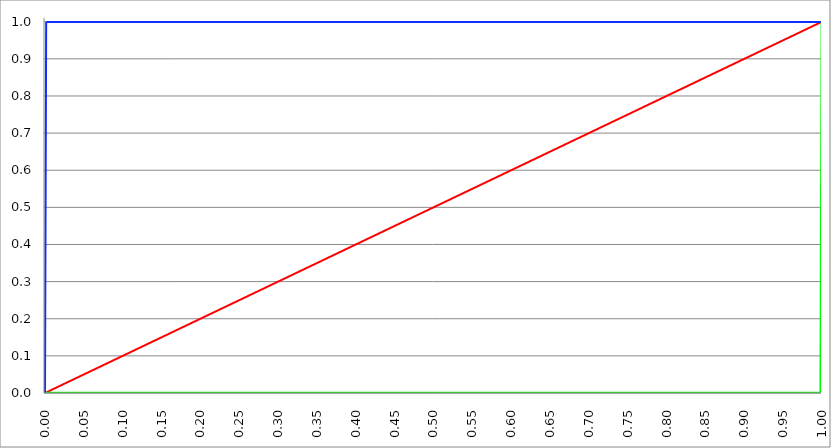
| Category | Series 1 | Series 0 | Series 2 |
|---|---|---|---|
| 0.0 | 0 | 0.001 | 0.001 |
| 0.0005 | 0 | 0.001 | 0.333 |
| 0.001 | 0.001 | 0.001 | 0.666 |
| 0.0015 | 0.002 | 0.001 | 0.999 |
| 0.002 | 0.002 | 0.001 | 0.999 |
| 0.0025 | 0.002 | 0.001 | 0.999 |
| 0.003 | 0.003 | 0.001 | 0.999 |
| 0.0035 | 0.004 | 0.001 | 0.999 |
| 0.004 | 0.004 | 0.001 | 0.999 |
| 0.0045 | 0.004 | 0.001 | 0.999 |
| 0.005 | 0.005 | 0.001 | 0.999 |
| 0.0055 | 0.006 | 0.001 | 0.999 |
| 0.006 | 0.006 | 0.001 | 0.999 |
| 0.0065 | 0.006 | 0.001 | 0.999 |
| 0.007 | 0.007 | 0.001 | 0.999 |
| 0.0075 | 0.008 | 0.001 | 0.999 |
| 0.008 | 0.008 | 0.001 | 0.999 |
| 0.0085 | 0.008 | 0.001 | 0.999 |
| 0.009 | 0.009 | 0.001 | 0.999 |
| 0.0095 | 0.01 | 0.001 | 0.999 |
| 0.01 | 0.01 | 0.001 | 0.999 |
| 0.0105 | 0.01 | 0.001 | 0.999 |
| 0.011 | 0.011 | 0.001 | 0.999 |
| 0.0115 | 0.012 | 0.001 | 0.999 |
| 0.012 | 0.012 | 0.001 | 0.999 |
| 0.0125 | 0.012 | 0.001 | 0.999 |
| 0.013 | 0.013 | 0.001 | 0.999 |
| 0.0135 | 0.014 | 0.001 | 0.999 |
| 0.014 | 0.014 | 0.001 | 0.999 |
| 0.0145 | 0.014 | 0.001 | 0.999 |
| 0.015 | 0.015 | 0.001 | 0.999 |
| 0.0155 | 0.016 | 0.001 | 0.999 |
| 0.016 | 0.016 | 0.001 | 0.999 |
| 0.0165 | 0.016 | 0.001 | 0.999 |
| 0.017 | 0.017 | 0.001 | 0.999 |
| 0.0175 | 0.018 | 0.001 | 0.999 |
| 0.018 | 0.018 | 0.001 | 0.999 |
| 0.0185 | 0.018 | 0.001 | 0.999 |
| 0.019 | 0.019 | 0.001 | 0.999 |
| 0.0195 | 0.02 | 0.001 | 0.999 |
| 0.02 | 0.02 | 0.001 | 0.999 |
| 0.0205 | 0.02 | 0.001 | 0.999 |
| 0.021 | 0.021 | 0.001 | 0.999 |
| 0.0215 | 0.022 | 0.001 | 0.999 |
| 0.022 | 0.022 | 0.001 | 0.999 |
| 0.0225 | 0.022 | 0.001 | 0.999 |
| 0.023 | 0.023 | 0.001 | 0.999 |
| 0.0235 | 0.024 | 0.001 | 0.999 |
| 0.024 | 0.024 | 0.001 | 0.999 |
| 0.0245 | 0.024 | 0.001 | 0.999 |
| 0.025 | 0.025 | 0.001 | 0.999 |
| 0.0255 | 0.026 | 0.001 | 0.999 |
| 0.026 | 0.026 | 0.001 | 0.999 |
| 0.0265 | 0.026 | 0.001 | 0.999 |
| 0.027 | 0.027 | 0.001 | 0.999 |
| 0.0275 | 0.028 | 0.001 | 0.999 |
| 0.028 | 0.028 | 0.001 | 0.999 |
| 0.0285 | 0.028 | 0.001 | 0.999 |
| 0.029 | 0.029 | 0.001 | 0.999 |
| 0.0295 | 0.03 | 0.001 | 0.999 |
| 0.03 | 0.03 | 0.001 | 0.999 |
| 0.0305 | 0.03 | 0.001 | 0.999 |
| 0.031 | 0.031 | 0.001 | 0.999 |
| 0.0315 | 0.032 | 0.001 | 0.999 |
| 0.032 | 0.032 | 0.001 | 0.999 |
| 0.0325 | 0.032 | 0.001 | 0.999 |
| 0.033 | 0.033 | 0.001 | 0.999 |
| 0.0335 | 0.034 | 0.001 | 0.999 |
| 0.034 | 0.034 | 0.001 | 0.999 |
| 0.0345 | 0.034 | 0.001 | 0.999 |
| 0.035 | 0.035 | 0.001 | 0.999 |
| 0.0355 | 0.036 | 0.001 | 0.999 |
| 0.036 | 0.036 | 0.001 | 0.999 |
| 0.0365 | 0.036 | 0.001 | 0.999 |
| 0.037 | 0.037 | 0.001 | 0.999 |
| 0.0375 | 0.038 | 0.001 | 0.999 |
| 0.038 | 0.038 | 0.001 | 0.999 |
| 0.0385 | 0.038 | 0.001 | 0.999 |
| 0.039 | 0.039 | 0.001 | 0.999 |
| 0.0395 | 0.04 | 0.001 | 0.999 |
| 0.04 | 0.04 | 0.001 | 0.999 |
| 0.0405 | 0.04 | 0.001 | 0.999 |
| 0.041 | 0.041 | 0.001 | 0.999 |
| 0.0415 | 0.042 | 0.001 | 0.999 |
| 0.042 | 0.042 | 0.001 | 0.999 |
| 0.0425 | 0.042 | 0.001 | 0.999 |
| 0.043 | 0.043 | 0.001 | 0.999 |
| 0.0435 | 0.044 | 0.001 | 0.999 |
| 0.044 | 0.044 | 0.001 | 0.999 |
| 0.0445 | 0.044 | 0.001 | 0.999 |
| 0.045 | 0.045 | 0.001 | 0.999 |
| 0.0455 | 0.046 | 0.001 | 0.999 |
| 0.046 | 0.046 | 0.001 | 0.999 |
| 0.0465 | 0.046 | 0.001 | 0.999 |
| 0.047 | 0.047 | 0.001 | 0.999 |
| 0.0475 | 0.048 | 0.001 | 0.999 |
| 0.048 | 0.048 | 0.001 | 0.999 |
| 0.0485 | 0.048 | 0.001 | 0.999 |
| 0.049 | 0.049 | 0.001 | 0.999 |
| 0.0495 | 0.05 | 0.001 | 0.999 |
| 0.05 | 0.05 | 0.001 | 0.999 |
| 0.0505 | 0.05 | 0.001 | 0.999 |
| 0.051 | 0.051 | 0.001 | 0.999 |
| 0.0515 | 0.052 | 0.001 | 0.999 |
| 0.052 | 0.052 | 0.001 | 0.999 |
| 0.0525 | 0.052 | 0.001 | 0.999 |
| 0.053 | 0.053 | 0.001 | 0.999 |
| 0.0535 | 0.054 | 0.001 | 0.999 |
| 0.054 | 0.054 | 0.001 | 0.999 |
| 0.0545 | 0.054 | 0.001 | 0.999 |
| 0.055 | 0.055 | 0.001 | 0.999 |
| 0.0555 | 0.056 | 0.001 | 0.999 |
| 0.056 | 0.056 | 0.001 | 0.999 |
| 0.0565 | 0.056 | 0.001 | 0.999 |
| 0.057 | 0.057 | 0.001 | 0.999 |
| 0.0575 | 0.058 | 0.001 | 0.999 |
| 0.058 | 0.058 | 0.001 | 0.999 |
| 0.0585 | 0.058 | 0.001 | 0.999 |
| 0.059 | 0.059 | 0.001 | 0.999 |
| 0.0595 | 0.06 | 0.001 | 0.999 |
| 0.06 | 0.06 | 0.001 | 0.999 |
| 0.0605 | 0.06 | 0.001 | 0.999 |
| 0.061 | 0.061 | 0.001 | 0.999 |
| 0.0615 | 0.062 | 0.001 | 0.999 |
| 0.062 | 0.062 | 0.001 | 0.999 |
| 0.0625 | 0.062 | 0.001 | 0.999 |
| 0.063 | 0.063 | 0.001 | 0.999 |
| 0.0635 | 0.064 | 0.001 | 0.999 |
| 0.064 | 0.064 | 0.001 | 0.999 |
| 0.0645 | 0.064 | 0.001 | 0.999 |
| 0.065 | 0.065 | 0.001 | 0.999 |
| 0.0655 | 0.066 | 0.001 | 0.999 |
| 0.066 | 0.066 | 0.001 | 0.999 |
| 0.0665 | 0.066 | 0.001 | 0.999 |
| 0.067 | 0.067 | 0.001 | 0.999 |
| 0.0675 | 0.068 | 0.001 | 0.999 |
| 0.068 | 0.068 | 0.001 | 0.999 |
| 0.0685 | 0.068 | 0.001 | 0.999 |
| 0.069 | 0.069 | 0.001 | 0.999 |
| 0.0695 | 0.07 | 0.001 | 0.999 |
| 0.07 | 0.07 | 0.001 | 0.999 |
| 0.0705 | 0.07 | 0.001 | 0.999 |
| 0.071 | 0.071 | 0.001 | 0.999 |
| 0.0715 | 0.072 | 0.001 | 0.999 |
| 0.072 | 0.072 | 0.001 | 0.999 |
| 0.0725 | 0.072 | 0.001 | 0.999 |
| 0.073 | 0.073 | 0.001 | 0.999 |
| 0.0735 | 0.074 | 0.001 | 0.999 |
| 0.074 | 0.074 | 0.001 | 0.999 |
| 0.0745 | 0.074 | 0.001 | 0.999 |
| 0.075 | 0.075 | 0.001 | 0.999 |
| 0.0755 | 0.076 | 0.001 | 0.999 |
| 0.076 | 0.076 | 0.001 | 0.999 |
| 0.0765 | 0.076 | 0.001 | 0.999 |
| 0.077 | 0.077 | 0.001 | 0.999 |
| 0.0775 | 0.078 | 0.001 | 0.999 |
| 0.078 | 0.078 | 0.001 | 0.999 |
| 0.0785 | 0.078 | 0.001 | 0.999 |
| 0.079 | 0.079 | 0.001 | 0.999 |
| 0.0795 | 0.08 | 0.001 | 0.999 |
| 0.08 | 0.08 | 0.001 | 0.999 |
| 0.0805 | 0.08 | 0.001 | 0.999 |
| 0.081 | 0.081 | 0.001 | 0.999 |
| 0.0815 | 0.082 | 0.001 | 0.999 |
| 0.082 | 0.082 | 0.001 | 0.999 |
| 0.0825 | 0.082 | 0.001 | 0.999 |
| 0.083 | 0.083 | 0.001 | 0.999 |
| 0.0835 | 0.084 | 0.001 | 0.999 |
| 0.084 | 0.084 | 0.001 | 0.999 |
| 0.0845 | 0.084 | 0.001 | 0.999 |
| 0.085 | 0.085 | 0.001 | 0.999 |
| 0.0855 | 0.086 | 0.001 | 0.999 |
| 0.086 | 0.086 | 0.001 | 0.999 |
| 0.0865 | 0.086 | 0.001 | 0.999 |
| 0.087 | 0.087 | 0.001 | 0.999 |
| 0.0875 | 0.088 | 0.001 | 0.999 |
| 0.088 | 0.088 | 0.001 | 0.999 |
| 0.0885 | 0.088 | 0.001 | 0.999 |
| 0.089 | 0.089 | 0.001 | 0.999 |
| 0.0895 | 0.09 | 0.001 | 0.999 |
| 0.09 | 0.09 | 0.001 | 0.999 |
| 0.0905 | 0.09 | 0.001 | 0.999 |
| 0.091 | 0.091 | 0.001 | 0.999 |
| 0.0915 | 0.092 | 0.001 | 0.999 |
| 0.092 | 0.092 | 0.001 | 0.999 |
| 0.0925 | 0.092 | 0.001 | 0.999 |
| 0.093 | 0.093 | 0.001 | 0.999 |
| 0.0935 | 0.094 | 0.001 | 0.999 |
| 0.094 | 0.094 | 0.001 | 0.999 |
| 0.0945 | 0.094 | 0.001 | 0.999 |
| 0.095 | 0.095 | 0.001 | 0.999 |
| 0.0955 | 0.096 | 0.001 | 0.999 |
| 0.096 | 0.096 | 0.001 | 0.999 |
| 0.0965 | 0.096 | 0.001 | 0.999 |
| 0.097 | 0.097 | 0.001 | 0.999 |
| 0.0975 | 0.098 | 0.001 | 0.999 |
| 0.098 | 0.098 | 0.001 | 0.999 |
| 0.0985 | 0.098 | 0.001 | 0.999 |
| 0.099 | 0.099 | 0.001 | 0.999 |
| 0.0995 | 0.1 | 0.001 | 0.999 |
| 0.1 | 0.1 | 0.001 | 0.999 |
| 0.1005 | 0.1 | 0.001 | 0.999 |
| 0.101 | 0.101 | 0.001 | 0.999 |
| 0.1015 | 0.102 | 0.001 | 0.999 |
| 0.102 | 0.102 | 0.001 | 0.999 |
| 0.1025 | 0.102 | 0.001 | 0.999 |
| 0.103 | 0.103 | 0.001 | 0.999 |
| 0.1035 | 0.104 | 0.001 | 0.999 |
| 0.104 | 0.104 | 0.001 | 0.999 |
| 0.1045 | 0.104 | 0.001 | 0.999 |
| 0.105 | 0.105 | 0.001 | 0.999 |
| 0.1055 | 0.106 | 0.001 | 0.999 |
| 0.106 | 0.106 | 0.001 | 0.999 |
| 0.1065 | 0.106 | 0.001 | 0.999 |
| 0.107 | 0.107 | 0.001 | 0.999 |
| 0.1075 | 0.108 | 0.001 | 0.999 |
| 0.108 | 0.108 | 0.001 | 0.999 |
| 0.1085 | 0.108 | 0.001 | 0.999 |
| 0.109 | 0.109 | 0.001 | 0.999 |
| 0.1095 | 0.11 | 0.001 | 0.999 |
| 0.11 | 0.11 | 0.001 | 0.999 |
| 0.1105 | 0.11 | 0.001 | 0.999 |
| 0.111 | 0.111 | 0.001 | 0.999 |
| 0.1115 | 0.112 | 0.001 | 0.999 |
| 0.112 | 0.112 | 0.001 | 0.999 |
| 0.1125 | 0.112 | 0.001 | 0.999 |
| 0.113 | 0.113 | 0.001 | 0.999 |
| 0.1135 | 0.114 | 0.001 | 0.999 |
| 0.114 | 0.114 | 0.001 | 0.999 |
| 0.1145 | 0.114 | 0.001 | 0.999 |
| 0.115 | 0.115 | 0.001 | 0.999 |
| 0.1155 | 0.116 | 0.001 | 0.999 |
| 0.116 | 0.116 | 0.001 | 0.999 |
| 0.1165 | 0.116 | 0.001 | 0.999 |
| 0.117 | 0.117 | 0.001 | 0.999 |
| 0.1175 | 0.118 | 0.001 | 0.999 |
| 0.118 | 0.118 | 0.001 | 0.999 |
| 0.1185 | 0.118 | 0.001 | 0.999 |
| 0.119 | 0.119 | 0.001 | 0.999 |
| 0.1195 | 0.12 | 0.001 | 0.999 |
| 0.12 | 0.12 | 0.001 | 0.999 |
| 0.1205 | 0.12 | 0.001 | 0.999 |
| 0.121 | 0.121 | 0.001 | 0.999 |
| 0.1215 | 0.122 | 0.001 | 0.999 |
| 0.122 | 0.122 | 0.001 | 0.999 |
| 0.1225 | 0.122 | 0.001 | 0.999 |
| 0.123 | 0.123 | 0.001 | 0.999 |
| 0.1235 | 0.124 | 0.001 | 0.999 |
| 0.124 | 0.124 | 0.001 | 0.999 |
| 0.1245 | 0.124 | 0.001 | 0.999 |
| 0.125 | 0.125 | 0.001 | 0.999 |
| 0.1255 | 0.126 | 0.001 | 0.999 |
| 0.126 | 0.126 | 0.001 | 0.999 |
| 0.1265 | 0.126 | 0.001 | 0.999 |
| 0.127 | 0.127 | 0.001 | 0.999 |
| 0.1275 | 0.128 | 0.001 | 0.999 |
| 0.128 | 0.128 | 0.001 | 0.999 |
| 0.1285 | 0.128 | 0.001 | 0.999 |
| 0.129 | 0.129 | 0.001 | 0.999 |
| 0.1295 | 0.13 | 0.001 | 0.999 |
| 0.13 | 0.13 | 0.001 | 0.999 |
| 0.1305 | 0.13 | 0.001 | 0.999 |
| 0.131 | 0.131 | 0.001 | 0.999 |
| 0.1315 | 0.132 | 0.001 | 0.999 |
| 0.132 | 0.132 | 0.001 | 0.999 |
| 0.1325 | 0.132 | 0.001 | 0.999 |
| 0.133 | 0.133 | 0.001 | 0.999 |
| 0.1335 | 0.134 | 0.001 | 0.999 |
| 0.134 | 0.134 | 0.001 | 0.999 |
| 0.1345 | 0.134 | 0.001 | 0.999 |
| 0.135 | 0.135 | 0.001 | 0.999 |
| 0.1355 | 0.136 | 0.001 | 0.999 |
| 0.136 | 0.136 | 0.001 | 0.999 |
| 0.1365 | 0.136 | 0.001 | 0.999 |
| 0.137 | 0.137 | 0.001 | 0.999 |
| 0.1375 | 0.138 | 0.001 | 0.999 |
| 0.138 | 0.138 | 0.001 | 0.999 |
| 0.1385 | 0.138 | 0.001 | 0.999 |
| 0.139 | 0.139 | 0.001 | 0.999 |
| 0.1395 | 0.14 | 0.001 | 0.999 |
| 0.14 | 0.14 | 0.001 | 0.999 |
| 0.1405 | 0.14 | 0.001 | 0.999 |
| 0.141 | 0.141 | 0.001 | 0.999 |
| 0.1415 | 0.142 | 0.001 | 0.999 |
| 0.142 | 0.142 | 0.001 | 0.999 |
| 0.1425 | 0.142 | 0.001 | 0.999 |
| 0.143 | 0.143 | 0.001 | 0.999 |
| 0.1435 | 0.144 | 0.001 | 0.999 |
| 0.144 | 0.144 | 0.001 | 0.999 |
| 0.1445 | 0.144 | 0.001 | 0.999 |
| 0.145 | 0.145 | 0.001 | 0.999 |
| 0.1455 | 0.146 | 0.001 | 0.999 |
| 0.146 | 0.146 | 0.001 | 0.999 |
| 0.1465 | 0.146 | 0.001 | 0.999 |
| 0.147 | 0.147 | 0.001 | 0.999 |
| 0.1475 | 0.148 | 0.001 | 0.999 |
| 0.148 | 0.148 | 0.001 | 0.999 |
| 0.1485 | 0.148 | 0.001 | 0.999 |
| 0.149 | 0.149 | 0.001 | 0.999 |
| 0.1495 | 0.15 | 0.001 | 0.999 |
| 0.15 | 0.15 | 0.001 | 0.999 |
| 0.1505 | 0.15 | 0.001 | 0.999 |
| 0.151 | 0.151 | 0.001 | 0.999 |
| 0.1515 | 0.152 | 0.001 | 0.999 |
| 0.152 | 0.152 | 0.001 | 0.999 |
| 0.1525 | 0.152 | 0.001 | 0.999 |
| 0.153 | 0.153 | 0.001 | 0.999 |
| 0.1535 | 0.154 | 0.001 | 0.999 |
| 0.154 | 0.154 | 0.001 | 0.999 |
| 0.1545 | 0.154 | 0.001 | 0.999 |
| 0.155 | 0.155 | 0.001 | 0.999 |
| 0.1555 | 0.156 | 0.001 | 0.999 |
| 0.156 | 0.156 | 0.001 | 0.999 |
| 0.1565 | 0.156 | 0.001 | 0.999 |
| 0.157 | 0.157 | 0.001 | 0.999 |
| 0.1575 | 0.158 | 0.001 | 0.999 |
| 0.158 | 0.158 | 0.001 | 0.999 |
| 0.1585 | 0.158 | 0.001 | 0.999 |
| 0.159 | 0.159 | 0.001 | 0.999 |
| 0.1595 | 0.16 | 0.001 | 0.999 |
| 0.16 | 0.16 | 0.001 | 0.999 |
| 0.1605 | 0.16 | 0.001 | 0.999 |
| 0.161 | 0.161 | 0.001 | 0.999 |
| 0.1615 | 0.162 | 0.001 | 0.999 |
| 0.162 | 0.162 | 0.001 | 0.999 |
| 0.1625 | 0.162 | 0.001 | 0.999 |
| 0.163 | 0.163 | 0.001 | 0.999 |
| 0.1635 | 0.164 | 0.001 | 0.999 |
| 0.164 | 0.164 | 0.001 | 0.999 |
| 0.1645 | 0.164 | 0.001 | 0.999 |
| 0.165 | 0.165 | 0.001 | 0.999 |
| 0.1655 | 0.166 | 0.001 | 0.999 |
| 0.166 | 0.166 | 0.001 | 0.999 |
| 0.1665 | 0.166 | 0.001 | 0.999 |
| 0.167 | 0.167 | 0.001 | 0.999 |
| 0.1675 | 0.168 | 0.001 | 0.999 |
| 0.168 | 0.168 | 0.001 | 0.999 |
| 0.1685 | 0.168 | 0.001 | 0.999 |
| 0.169 | 0.169 | 0.001 | 0.999 |
| 0.1695 | 0.17 | 0.001 | 0.999 |
| 0.17 | 0.17 | 0.001 | 0.999 |
| 0.1705 | 0.17 | 0.001 | 0.999 |
| 0.171 | 0.171 | 0.001 | 0.999 |
| 0.1715 | 0.172 | 0.001 | 0.999 |
| 0.172 | 0.172 | 0.001 | 0.999 |
| 0.1725 | 0.172 | 0.001 | 0.999 |
| 0.173 | 0.173 | 0.001 | 0.999 |
| 0.1735 | 0.174 | 0.001 | 0.999 |
| 0.174 | 0.174 | 0.001 | 0.999 |
| 0.1745 | 0.174 | 0.001 | 0.999 |
| 0.175 | 0.175 | 0.001 | 0.999 |
| 0.1755 | 0.176 | 0.001 | 0.999 |
| 0.176 | 0.176 | 0.001 | 0.999 |
| 0.1765 | 0.176 | 0.001 | 0.999 |
| 0.177 | 0.177 | 0.001 | 0.999 |
| 0.1775 | 0.178 | 0.001 | 0.999 |
| 0.178 | 0.178 | 0.001 | 0.999 |
| 0.1785 | 0.178 | 0.001 | 0.999 |
| 0.179 | 0.179 | 0.001 | 0.999 |
| 0.1795 | 0.18 | 0.001 | 0.999 |
| 0.18 | 0.18 | 0.001 | 0.999 |
| 0.1805 | 0.18 | 0.001 | 0.999 |
| 0.181 | 0.181 | 0.001 | 0.999 |
| 0.1815 | 0.182 | 0.001 | 0.999 |
| 0.182 | 0.182 | 0.001 | 0.999 |
| 0.1825 | 0.182 | 0.001 | 0.999 |
| 0.183 | 0.183 | 0.001 | 0.999 |
| 0.1835 | 0.184 | 0.001 | 0.999 |
| 0.184 | 0.184 | 0.001 | 0.999 |
| 0.1845 | 0.184 | 0.001 | 0.999 |
| 0.185 | 0.185 | 0.001 | 0.999 |
| 0.1855 | 0.186 | 0.001 | 0.999 |
| 0.186 | 0.186 | 0.001 | 0.999 |
| 0.1865 | 0.186 | 0.001 | 0.999 |
| 0.187 | 0.187 | 0.001 | 0.999 |
| 0.1875 | 0.188 | 0.001 | 0.999 |
| 0.188 | 0.188 | 0.001 | 0.999 |
| 0.1885 | 0.188 | 0.001 | 0.999 |
| 0.189 | 0.189 | 0.001 | 0.999 |
| 0.1895 | 0.19 | 0.001 | 0.999 |
| 0.19 | 0.19 | 0.001 | 0.999 |
| 0.1905 | 0.19 | 0.001 | 0.999 |
| 0.191 | 0.191 | 0.001 | 0.999 |
| 0.1915 | 0.192 | 0.001 | 0.999 |
| 0.192 | 0.192 | 0.001 | 0.999 |
| 0.1925 | 0.192 | 0.001 | 0.999 |
| 0.193 | 0.193 | 0.001 | 0.999 |
| 0.1935 | 0.194 | 0.001 | 0.999 |
| 0.194 | 0.194 | 0.001 | 0.999 |
| 0.1945 | 0.194 | 0.001 | 0.999 |
| 0.195 | 0.195 | 0.001 | 0.999 |
| 0.1955 | 0.196 | 0.001 | 0.999 |
| 0.196 | 0.196 | 0.001 | 0.999 |
| 0.1965 | 0.196 | 0.001 | 0.999 |
| 0.197 | 0.197 | 0.001 | 0.999 |
| 0.1975 | 0.198 | 0.001 | 0.999 |
| 0.198 | 0.198 | 0.001 | 0.999 |
| 0.1985 | 0.198 | 0.001 | 0.999 |
| 0.199 | 0.199 | 0.001 | 0.999 |
| 0.1995 | 0.2 | 0.001 | 0.999 |
| 0.2 | 0.2 | 0.001 | 0.999 |
| 0.2005 | 0.2 | 0.001 | 0.999 |
| 0.201 | 0.201 | 0.001 | 0.999 |
| 0.2015 | 0.202 | 0.001 | 0.999 |
| 0.202 | 0.202 | 0.001 | 0.999 |
| 0.2025 | 0.202 | 0.001 | 0.999 |
| 0.203 | 0.203 | 0.001 | 0.999 |
| 0.2035 | 0.204 | 0.001 | 0.999 |
| 0.204 | 0.204 | 0.001 | 0.999 |
| 0.2045 | 0.204 | 0.001 | 0.999 |
| 0.205 | 0.205 | 0.001 | 0.999 |
| 0.2055 | 0.206 | 0.001 | 0.999 |
| 0.206 | 0.206 | 0.001 | 0.999 |
| 0.2065 | 0.206 | 0.001 | 0.999 |
| 0.207 | 0.207 | 0.001 | 0.999 |
| 0.2075 | 0.208 | 0.001 | 0.999 |
| 0.208 | 0.208 | 0.001 | 0.999 |
| 0.2085 | 0.208 | 0.001 | 0.999 |
| 0.209 | 0.209 | 0.001 | 0.999 |
| 0.2095 | 0.21 | 0.001 | 0.999 |
| 0.21 | 0.21 | 0.001 | 0.999 |
| 0.2105 | 0.21 | 0.001 | 0.999 |
| 0.211 | 0.211 | 0.001 | 0.999 |
| 0.2115 | 0.212 | 0.001 | 0.999 |
| 0.212 | 0.212 | 0.001 | 0.999 |
| 0.2125 | 0.212 | 0.001 | 0.999 |
| 0.213 | 0.213 | 0.001 | 0.999 |
| 0.2135 | 0.214 | 0.001 | 0.999 |
| 0.214 | 0.214 | 0.001 | 0.999 |
| 0.2145 | 0.214 | 0.001 | 0.999 |
| 0.215 | 0.215 | 0.001 | 0.999 |
| 0.2155 | 0.216 | 0.001 | 0.999 |
| 0.216 | 0.216 | 0.001 | 0.999 |
| 0.2165 | 0.216 | 0.001 | 0.999 |
| 0.217 | 0.217 | 0.001 | 0.999 |
| 0.2175 | 0.218 | 0.001 | 0.999 |
| 0.218 | 0.218 | 0.001 | 0.999 |
| 0.2185 | 0.218 | 0.001 | 0.999 |
| 0.219 | 0.219 | 0.001 | 0.999 |
| 0.2195 | 0.22 | 0.001 | 0.999 |
| 0.22 | 0.22 | 0.001 | 0.999 |
| 0.2205 | 0.22 | 0.001 | 0.999 |
| 0.221 | 0.221 | 0.001 | 0.999 |
| 0.2215 | 0.222 | 0.001 | 0.999 |
| 0.222 | 0.222 | 0.001 | 0.999 |
| 0.2225 | 0.222 | 0.001 | 0.999 |
| 0.223 | 0.223 | 0.001 | 0.999 |
| 0.2235 | 0.224 | 0.001 | 0.999 |
| 0.224 | 0.224 | 0.001 | 0.999 |
| 0.2245 | 0.224 | 0.001 | 0.999 |
| 0.225 | 0.225 | 0.001 | 0.999 |
| 0.2255 | 0.226 | 0.001 | 0.999 |
| 0.226 | 0.226 | 0.001 | 0.999 |
| 0.2265 | 0.226 | 0.001 | 0.999 |
| 0.227 | 0.227 | 0.001 | 0.999 |
| 0.2275 | 0.228 | 0.001 | 0.999 |
| 0.228 | 0.228 | 0.001 | 0.999 |
| 0.2285 | 0.228 | 0.001 | 0.999 |
| 0.229 | 0.229 | 0.001 | 0.999 |
| 0.2295 | 0.23 | 0.001 | 0.999 |
| 0.23 | 0.23 | 0.001 | 0.999 |
| 0.2305 | 0.23 | 0.001 | 0.999 |
| 0.231 | 0.231 | 0.001 | 0.999 |
| 0.2315 | 0.232 | 0.001 | 0.999 |
| 0.232 | 0.232 | 0.001 | 0.999 |
| 0.2325 | 0.232 | 0.001 | 0.999 |
| 0.233 | 0.233 | 0.001 | 0.999 |
| 0.2335 | 0.234 | 0.001 | 0.999 |
| 0.234 | 0.234 | 0.001 | 0.999 |
| 0.2345 | 0.234 | 0.001 | 0.999 |
| 0.235 | 0.235 | 0.001 | 0.999 |
| 0.2355 | 0.236 | 0.001 | 0.999 |
| 0.236 | 0.236 | 0.001 | 0.999 |
| 0.2365 | 0.236 | 0.001 | 0.999 |
| 0.237 | 0.237 | 0.001 | 0.999 |
| 0.2375 | 0.238 | 0.001 | 0.999 |
| 0.238 | 0.238 | 0.001 | 0.999 |
| 0.2385 | 0.238 | 0.001 | 0.999 |
| 0.239 | 0.239 | 0.001 | 0.999 |
| 0.2395 | 0.24 | 0.001 | 0.999 |
| 0.24 | 0.24 | 0.001 | 0.999 |
| 0.2405 | 0.24 | 0.001 | 0.999 |
| 0.241 | 0.241 | 0.001 | 0.999 |
| 0.2415 | 0.242 | 0.001 | 0.999 |
| 0.242 | 0.242 | 0.001 | 0.999 |
| 0.2425 | 0.242 | 0.001 | 0.999 |
| 0.243 | 0.243 | 0.001 | 0.999 |
| 0.2435 | 0.244 | 0.001 | 0.999 |
| 0.244 | 0.244 | 0.001 | 0.999 |
| 0.2445 | 0.244 | 0.001 | 0.999 |
| 0.245 | 0.245 | 0.001 | 0.999 |
| 0.2455 | 0.246 | 0.001 | 0.999 |
| 0.246 | 0.246 | 0.001 | 0.999 |
| 0.2465 | 0.246 | 0.001 | 0.999 |
| 0.247 | 0.247 | 0.001 | 0.999 |
| 0.2475 | 0.248 | 0.001 | 0.999 |
| 0.248 | 0.248 | 0.001 | 0.999 |
| 0.2485 | 0.248 | 0.001 | 0.999 |
| 0.249 | 0.249 | 0.001 | 0.999 |
| 0.2495 | 0.25 | 0.001 | 0.999 |
| 0.25 | 0.25 | 0.001 | 0.999 |
| 0.2505 | 0.25 | 0.001 | 0.999 |
| 0.251 | 0.251 | 0.001 | 0.999 |
| 0.2515 | 0.252 | 0.001 | 0.999 |
| 0.252 | 0.252 | 0.001 | 0.999 |
| 0.2525 | 0.252 | 0.001 | 0.999 |
| 0.253 | 0.253 | 0.001 | 0.999 |
| 0.2535 | 0.254 | 0.001 | 0.999 |
| 0.254 | 0.254 | 0.001 | 0.999 |
| 0.2545 | 0.254 | 0.001 | 0.999 |
| 0.255 | 0.255 | 0.001 | 0.999 |
| 0.2555 | 0.256 | 0.001 | 0.999 |
| 0.256 | 0.256 | 0.001 | 0.999 |
| 0.2565 | 0.256 | 0.001 | 0.999 |
| 0.257 | 0.257 | 0.001 | 0.999 |
| 0.2575 | 0.258 | 0.001 | 0.999 |
| 0.258 | 0.258 | 0.001 | 0.999 |
| 0.2585 | 0.258 | 0.001 | 0.999 |
| 0.259 | 0.259 | 0.001 | 0.999 |
| 0.2595 | 0.26 | 0.001 | 0.999 |
| 0.26 | 0.26 | 0.001 | 0.999 |
| 0.2605 | 0.26 | 0.001 | 0.999 |
| 0.261 | 0.261 | 0.001 | 0.999 |
| 0.2615 | 0.262 | 0.001 | 0.999 |
| 0.262 | 0.262 | 0.001 | 0.999 |
| 0.2625 | 0.262 | 0.001 | 0.999 |
| 0.263 | 0.263 | 0.001 | 0.999 |
| 0.2635 | 0.264 | 0.001 | 0.999 |
| 0.264 | 0.264 | 0.001 | 0.999 |
| 0.2645 | 0.264 | 0.001 | 0.999 |
| 0.265 | 0.265 | 0.001 | 0.999 |
| 0.2655 | 0.266 | 0.001 | 0.999 |
| 0.266 | 0.266 | 0.001 | 0.999 |
| 0.2665 | 0.266 | 0.001 | 0.999 |
| 0.267 | 0.267 | 0.001 | 0.999 |
| 0.2675 | 0.268 | 0.001 | 0.999 |
| 0.268 | 0.268 | 0.001 | 0.999 |
| 0.2685 | 0.268 | 0.001 | 0.999 |
| 0.269 | 0.269 | 0.001 | 0.999 |
| 0.2695 | 0.27 | 0.001 | 0.999 |
| 0.27 | 0.27 | 0.001 | 0.999 |
| 0.2705 | 0.27 | 0.001 | 0.999 |
| 0.271 | 0.271 | 0.001 | 0.999 |
| 0.2715 | 0.272 | 0.001 | 0.999 |
| 0.272 | 0.272 | 0.001 | 0.999 |
| 0.2725 | 0.272 | 0.001 | 0.999 |
| 0.273 | 0.273 | 0.001 | 0.999 |
| 0.2735 | 0.274 | 0.001 | 0.999 |
| 0.274 | 0.274 | 0.001 | 0.999 |
| 0.2745 | 0.274 | 0.001 | 0.999 |
| 0.275 | 0.275 | 0.001 | 0.999 |
| 0.2755 | 0.276 | 0.001 | 0.999 |
| 0.276 | 0.276 | 0.001 | 0.999 |
| 0.2765 | 0.276 | 0.001 | 0.999 |
| 0.277 | 0.277 | 0.001 | 0.999 |
| 0.2775 | 0.278 | 0.001 | 0.999 |
| 0.278 | 0.278 | 0.001 | 0.999 |
| 0.2785 | 0.278 | 0.001 | 0.999 |
| 0.279 | 0.279 | 0.001 | 0.999 |
| 0.2795 | 0.28 | 0.001 | 0.999 |
| 0.28 | 0.28 | 0.001 | 0.999 |
| 0.2805 | 0.28 | 0.001 | 0.999 |
| 0.281 | 0.281 | 0.001 | 0.999 |
| 0.2815 | 0.282 | 0.001 | 0.999 |
| 0.282 | 0.282 | 0.001 | 0.999 |
| 0.2825 | 0.282 | 0.001 | 0.999 |
| 0.283 | 0.283 | 0.001 | 0.999 |
| 0.2835 | 0.284 | 0.001 | 0.999 |
| 0.284 | 0.284 | 0.001 | 0.999 |
| 0.2845 | 0.284 | 0.001 | 0.999 |
| 0.285 | 0.285 | 0.001 | 0.999 |
| 0.2855 | 0.286 | 0.001 | 0.999 |
| 0.286 | 0.286 | 0.001 | 0.999 |
| 0.2865 | 0.286 | 0.001 | 0.999 |
| 0.287 | 0.287 | 0.001 | 0.999 |
| 0.2875 | 0.288 | 0.001 | 0.999 |
| 0.288 | 0.288 | 0.001 | 0.999 |
| 0.2885 | 0.288 | 0.001 | 0.999 |
| 0.289 | 0.289 | 0.001 | 0.999 |
| 0.2895 | 0.29 | 0.001 | 0.999 |
| 0.29 | 0.29 | 0.001 | 0.999 |
| 0.2905 | 0.29 | 0.001 | 0.999 |
| 0.291 | 0.291 | 0.001 | 0.999 |
| 0.2915 | 0.292 | 0.001 | 0.999 |
| 0.292 | 0.292 | 0.001 | 0.999 |
| 0.2925 | 0.292 | 0.001 | 0.999 |
| 0.293 | 0.293 | 0.001 | 0.999 |
| 0.2935 | 0.294 | 0.001 | 0.999 |
| 0.294 | 0.294 | 0.001 | 0.999 |
| 0.2945 | 0.294 | 0.001 | 0.999 |
| 0.295 | 0.295 | 0.001 | 0.999 |
| 0.2955 | 0.296 | 0.001 | 0.999 |
| 0.296 | 0.296 | 0.001 | 0.999 |
| 0.2965 | 0.296 | 0.001 | 0.999 |
| 0.297 | 0.297 | 0.001 | 0.999 |
| 0.2975 | 0.298 | 0.001 | 0.999 |
| 0.298 | 0.298 | 0.001 | 0.999 |
| 0.2985 | 0.298 | 0.001 | 0.999 |
| 0.299 | 0.299 | 0.001 | 0.999 |
| 0.2995 | 0.3 | 0.001 | 0.999 |
| 0.3 | 0.3 | 0.001 | 0.999 |
| 0.3005 | 0.3 | 0.001 | 0.999 |
| 0.301 | 0.301 | 0.001 | 0.999 |
| 0.3015 | 0.302 | 0.001 | 0.999 |
| 0.302 | 0.302 | 0.001 | 0.999 |
| 0.3025 | 0.302 | 0.001 | 0.999 |
| 0.303 | 0.303 | 0.001 | 0.999 |
| 0.3035 | 0.304 | 0.001 | 0.999 |
| 0.304 | 0.304 | 0.001 | 0.999 |
| 0.3045 | 0.304 | 0.001 | 0.999 |
| 0.305 | 0.305 | 0.001 | 0.999 |
| 0.3055 | 0.306 | 0.001 | 0.999 |
| 0.306 | 0.306 | 0.001 | 0.999 |
| 0.3065 | 0.306 | 0.001 | 0.999 |
| 0.307 | 0.307 | 0.001 | 0.999 |
| 0.3075 | 0.308 | 0.001 | 0.999 |
| 0.308 | 0.308 | 0.001 | 0.999 |
| 0.3085 | 0.308 | 0.001 | 0.999 |
| 0.309 | 0.309 | 0.001 | 0.999 |
| 0.3095 | 0.31 | 0.001 | 0.999 |
| 0.31 | 0.31 | 0.001 | 0.999 |
| 0.3105 | 0.31 | 0.001 | 0.999 |
| 0.311 | 0.311 | 0.001 | 0.999 |
| 0.3115 | 0.312 | 0.001 | 0.999 |
| 0.312 | 0.312 | 0.001 | 0.999 |
| 0.3125 | 0.312 | 0.001 | 0.999 |
| 0.313 | 0.313 | 0.001 | 0.999 |
| 0.3135 | 0.314 | 0.001 | 0.999 |
| 0.314 | 0.314 | 0.001 | 0.999 |
| 0.3145 | 0.314 | 0.001 | 0.999 |
| 0.315 | 0.315 | 0.001 | 0.999 |
| 0.3155 | 0.316 | 0.001 | 0.999 |
| 0.316 | 0.316 | 0.001 | 0.999 |
| 0.3165 | 0.316 | 0.001 | 0.999 |
| 0.317 | 0.317 | 0.001 | 0.999 |
| 0.3175 | 0.318 | 0.001 | 0.999 |
| 0.318 | 0.318 | 0.001 | 0.999 |
| 0.3185 | 0.318 | 0.001 | 0.999 |
| 0.319 | 0.319 | 0.001 | 0.999 |
| 0.3195 | 0.32 | 0.001 | 0.999 |
| 0.32 | 0.32 | 0.001 | 0.999 |
| 0.3205 | 0.32 | 0.001 | 0.999 |
| 0.321 | 0.321 | 0.001 | 0.999 |
| 0.3215 | 0.322 | 0.001 | 0.999 |
| 0.322 | 0.322 | 0.001 | 0.999 |
| 0.3225 | 0.322 | 0.001 | 0.999 |
| 0.323 | 0.323 | 0.001 | 0.999 |
| 0.3235 | 0.324 | 0.001 | 0.999 |
| 0.324 | 0.324 | 0.001 | 0.999 |
| 0.3245 | 0.324 | 0.001 | 0.999 |
| 0.325 | 0.325 | 0.001 | 0.999 |
| 0.3255 | 0.326 | 0.001 | 0.999 |
| 0.326 | 0.326 | 0.001 | 0.999 |
| 0.3265 | 0.326 | 0.001 | 0.999 |
| 0.327 | 0.327 | 0.001 | 0.999 |
| 0.3275 | 0.328 | 0.001 | 0.999 |
| 0.328 | 0.328 | 0.001 | 0.999 |
| 0.3285 | 0.328 | 0.001 | 0.999 |
| 0.329 | 0.329 | 0.001 | 0.999 |
| 0.3295 | 0.33 | 0.001 | 0.999 |
| 0.33 | 0.33 | 0.001 | 0.999 |
| 0.3305 | 0.33 | 0.001 | 0.999 |
| 0.331 | 0.331 | 0.001 | 0.999 |
| 0.3315 | 0.332 | 0.001 | 0.999 |
| 0.332 | 0.332 | 0.001 | 0.999 |
| 0.3325 | 0.332 | 0.001 | 0.999 |
| 0.333 | 0.333 | 0.001 | 0.999 |
| 0.3335 | 0.334 | 0.001 | 0.999 |
| 0.334 | 0.334 | 0.001 | 0.999 |
| 0.3345 | 0.334 | 0.001 | 0.999 |
| 0.335 | 0.335 | 0.001 | 0.999 |
| 0.3355 | 0.336 | 0.001 | 0.999 |
| 0.336 | 0.336 | 0.001 | 0.999 |
| 0.3365 | 0.336 | 0.001 | 0.999 |
| 0.337 | 0.337 | 0.001 | 0.999 |
| 0.3375 | 0.338 | 0.001 | 0.999 |
| 0.338 | 0.338 | 0.001 | 0.999 |
| 0.3385 | 0.338 | 0.001 | 0.999 |
| 0.339 | 0.339 | 0.001 | 0.999 |
| 0.3395 | 0.34 | 0.001 | 0.999 |
| 0.34 | 0.34 | 0.001 | 0.999 |
| 0.3405 | 0.34 | 0.001 | 0.999 |
| 0.341 | 0.341 | 0.001 | 0.999 |
| 0.3415 | 0.342 | 0.001 | 0.999 |
| 0.342 | 0.342 | 0.001 | 0.999 |
| 0.3425 | 0.342 | 0.001 | 0.999 |
| 0.343 | 0.343 | 0.001 | 0.999 |
| 0.3435 | 0.344 | 0.001 | 0.999 |
| 0.344 | 0.344 | 0.001 | 0.999 |
| 0.3445 | 0.344 | 0.001 | 0.999 |
| 0.345 | 0.345 | 0.001 | 0.999 |
| 0.3455 | 0.346 | 0.001 | 0.999 |
| 0.346 | 0.346 | 0.001 | 0.999 |
| 0.3465 | 0.346 | 0.001 | 0.999 |
| 0.347 | 0.347 | 0.001 | 0.999 |
| 0.3475 | 0.348 | 0.001 | 0.999 |
| 0.348 | 0.348 | 0.001 | 0.999 |
| 0.3485 | 0.348 | 0.001 | 0.999 |
| 0.349 | 0.349 | 0.001 | 0.999 |
| 0.3495 | 0.35 | 0.001 | 0.999 |
| 0.35 | 0.35 | 0.001 | 0.999 |
| 0.3505 | 0.35 | 0.001 | 0.999 |
| 0.351 | 0.351 | 0.001 | 0.999 |
| 0.3515 | 0.352 | 0.001 | 0.999 |
| 0.352 | 0.352 | 0.001 | 0.999 |
| 0.3525 | 0.352 | 0.001 | 0.999 |
| 0.353 | 0.353 | 0.001 | 0.999 |
| 0.3535 | 0.354 | 0.001 | 0.999 |
| 0.354 | 0.354 | 0.001 | 0.999 |
| 0.3545 | 0.354 | 0.001 | 0.999 |
| 0.355 | 0.355 | 0.001 | 0.999 |
| 0.3555 | 0.356 | 0.001 | 0.999 |
| 0.356 | 0.356 | 0.001 | 0.999 |
| 0.3565 | 0.356 | 0.001 | 0.999 |
| 0.357 | 0.357 | 0.001 | 0.999 |
| 0.3575 | 0.358 | 0.001 | 0.999 |
| 0.358 | 0.358 | 0.001 | 0.999 |
| 0.3585 | 0.358 | 0.001 | 0.999 |
| 0.359 | 0.359 | 0.001 | 0.999 |
| 0.3595 | 0.36 | 0.001 | 0.999 |
| 0.36 | 0.36 | 0.001 | 0.999 |
| 0.3605 | 0.36 | 0.001 | 0.999 |
| 0.361 | 0.361 | 0.001 | 0.999 |
| 0.3615 | 0.362 | 0.001 | 0.999 |
| 0.362 | 0.362 | 0.001 | 0.999 |
| 0.3625 | 0.362 | 0.001 | 0.999 |
| 0.363 | 0.363 | 0.001 | 0.999 |
| 0.3635 | 0.364 | 0.001 | 0.999 |
| 0.364 | 0.364 | 0.001 | 0.999 |
| 0.3645 | 0.364 | 0.001 | 0.999 |
| 0.365 | 0.365 | 0.001 | 0.999 |
| 0.3655 | 0.366 | 0.001 | 0.999 |
| 0.366 | 0.366 | 0.001 | 0.999 |
| 0.3665 | 0.366 | 0.001 | 0.999 |
| 0.367 | 0.367 | 0.001 | 0.999 |
| 0.3675 | 0.368 | 0.001 | 0.999 |
| 0.368 | 0.368 | 0.001 | 0.999 |
| 0.3685 | 0.368 | 0.001 | 0.999 |
| 0.369 | 0.369 | 0.001 | 0.999 |
| 0.3695 | 0.37 | 0.001 | 0.999 |
| 0.37 | 0.37 | 0.001 | 0.999 |
| 0.3705 | 0.37 | 0.001 | 0.999 |
| 0.371 | 0.371 | 0.001 | 0.999 |
| 0.3715 | 0.372 | 0.001 | 0.999 |
| 0.372 | 0.372 | 0.001 | 0.999 |
| 0.3725 | 0.372 | 0.001 | 0.999 |
| 0.373 | 0.373 | 0.001 | 0.999 |
| 0.3735 | 0.374 | 0.001 | 0.999 |
| 0.374 | 0.374 | 0.001 | 0.999 |
| 0.3745 | 0.374 | 0.001 | 0.999 |
| 0.375 | 0.375 | 0.001 | 0.999 |
| 0.3755 | 0.376 | 0.001 | 0.999 |
| 0.376 | 0.376 | 0.001 | 0.999 |
| 0.3765 | 0.376 | 0.001 | 0.999 |
| 0.377 | 0.377 | 0.001 | 0.999 |
| 0.3775 | 0.378 | 0.001 | 0.999 |
| 0.378 | 0.378 | 0.001 | 0.999 |
| 0.3785 | 0.378 | 0.001 | 0.999 |
| 0.379 | 0.379 | 0.001 | 0.999 |
| 0.3795 | 0.38 | 0.001 | 0.999 |
| 0.38 | 0.38 | 0.001 | 0.999 |
| 0.3805 | 0.38 | 0.001 | 0.999 |
| 0.381 | 0.381 | 0.001 | 0.999 |
| 0.3815 | 0.382 | 0.001 | 0.999 |
| 0.382 | 0.382 | 0.001 | 0.999 |
| 0.3825 | 0.382 | 0.001 | 0.999 |
| 0.383 | 0.383 | 0.001 | 0.999 |
| 0.3835 | 0.384 | 0.001 | 0.999 |
| 0.384 | 0.384 | 0.001 | 0.999 |
| 0.3845 | 0.384 | 0.001 | 0.999 |
| 0.385 | 0.385 | 0.001 | 0.999 |
| 0.3855 | 0.386 | 0.001 | 0.999 |
| 0.386 | 0.386 | 0.001 | 0.999 |
| 0.3865 | 0.386 | 0.001 | 0.999 |
| 0.387 | 0.387 | 0.001 | 0.999 |
| 0.3875 | 0.388 | 0.001 | 0.999 |
| 0.388 | 0.388 | 0.001 | 0.999 |
| 0.3885 | 0.388 | 0.001 | 0.999 |
| 0.389 | 0.389 | 0.001 | 0.999 |
| 0.3895 | 0.39 | 0.001 | 0.999 |
| 0.39 | 0.39 | 0.001 | 0.999 |
| 0.3905 | 0.39 | 0.001 | 0.999 |
| 0.391 | 0.391 | 0.001 | 0.999 |
| 0.3915 | 0.392 | 0.001 | 0.999 |
| 0.392 | 0.392 | 0.001 | 0.999 |
| 0.3925 | 0.392 | 0.001 | 0.999 |
| 0.393 | 0.393 | 0.001 | 0.999 |
| 0.3935 | 0.394 | 0.001 | 0.999 |
| 0.394 | 0.394 | 0.001 | 0.999 |
| 0.3945 | 0.394 | 0.001 | 0.999 |
| 0.395 | 0.395 | 0.001 | 0.999 |
| 0.3955 | 0.396 | 0.001 | 0.999 |
| 0.396 | 0.396 | 0.001 | 0.999 |
| 0.3965 | 0.396 | 0.001 | 0.999 |
| 0.397 | 0.397 | 0.001 | 0.999 |
| 0.3975 | 0.398 | 0.001 | 0.999 |
| 0.398 | 0.398 | 0.001 | 0.999 |
| 0.3985 | 0.398 | 0.001 | 0.999 |
| 0.399 | 0.399 | 0.001 | 0.999 |
| 0.3995 | 0.4 | 0.001 | 0.999 |
| 0.4 | 0.4 | 0.001 | 0.999 |
| 0.4005 | 0.4 | 0.001 | 0.999 |
| 0.401 | 0.401 | 0.001 | 0.999 |
| 0.4015 | 0.402 | 0.001 | 0.999 |
| 0.402 | 0.402 | 0.001 | 0.999 |
| 0.4025 | 0.402 | 0.001 | 0.999 |
| 0.403 | 0.403 | 0.001 | 0.999 |
| 0.4035 | 0.404 | 0.001 | 0.999 |
| 0.404 | 0.404 | 0.001 | 0.999 |
| 0.4045 | 0.404 | 0.001 | 0.999 |
| 0.405 | 0.405 | 0.001 | 0.999 |
| 0.4055 | 0.406 | 0.001 | 0.999 |
| 0.406 | 0.406 | 0.001 | 0.999 |
| 0.4065 | 0.406 | 0.001 | 0.999 |
| 0.407 | 0.407 | 0.001 | 0.999 |
| 0.4075 | 0.408 | 0.001 | 0.999 |
| 0.408 | 0.408 | 0.001 | 0.999 |
| 0.4085 | 0.408 | 0.001 | 0.999 |
| 0.409 | 0.409 | 0.001 | 0.999 |
| 0.4095 | 0.41 | 0.001 | 0.999 |
| 0.41 | 0.41 | 0.001 | 0.999 |
| 0.4105 | 0.41 | 0.001 | 0.999 |
| 0.411 | 0.411 | 0.001 | 0.999 |
| 0.4115 | 0.412 | 0.001 | 0.999 |
| 0.412 | 0.412 | 0.001 | 0.999 |
| 0.4125 | 0.412 | 0.001 | 0.999 |
| 0.413 | 0.413 | 0.001 | 0.999 |
| 0.4135 | 0.414 | 0.001 | 0.999 |
| 0.414 | 0.414 | 0.001 | 0.999 |
| 0.4145 | 0.414 | 0.001 | 0.999 |
| 0.415 | 0.415 | 0.001 | 0.999 |
| 0.4155 | 0.416 | 0.001 | 0.999 |
| 0.416 | 0.416 | 0.001 | 0.999 |
| 0.4165 | 0.416 | 0.001 | 0.999 |
| 0.417 | 0.417 | 0.001 | 0.999 |
| 0.4175 | 0.418 | 0.001 | 0.999 |
| 0.418 | 0.418 | 0.001 | 0.999 |
| 0.4185 | 0.418 | 0.001 | 0.999 |
| 0.419 | 0.419 | 0.001 | 0.999 |
| 0.4195 | 0.42 | 0.001 | 0.999 |
| 0.42 | 0.42 | 0.001 | 0.999 |
| 0.4205 | 0.42 | 0.001 | 0.999 |
| 0.421 | 0.421 | 0.001 | 0.999 |
| 0.4215 | 0.422 | 0.001 | 0.999 |
| 0.422 | 0.422 | 0.001 | 0.999 |
| 0.4225 | 0.422 | 0.001 | 0.999 |
| 0.423 | 0.423 | 0.001 | 0.999 |
| 0.4235 | 0.424 | 0.001 | 0.999 |
| 0.424 | 0.424 | 0.001 | 0.999 |
| 0.4245 | 0.424 | 0.001 | 0.999 |
| 0.425 | 0.425 | 0.001 | 0.999 |
| 0.4255 | 0.426 | 0.001 | 0.999 |
| 0.426 | 0.426 | 0.001 | 0.999 |
| 0.4265 | 0.426 | 0.001 | 0.999 |
| 0.427 | 0.427 | 0.001 | 0.999 |
| 0.4275 | 0.428 | 0.001 | 0.999 |
| 0.428 | 0.428 | 0.001 | 0.999 |
| 0.4285 | 0.428 | 0.001 | 0.999 |
| 0.429 | 0.429 | 0.001 | 0.999 |
| 0.4295 | 0.43 | 0.001 | 0.999 |
| 0.43 | 0.43 | 0.001 | 0.999 |
| 0.4305 | 0.43 | 0.001 | 0.999 |
| 0.431 | 0.431 | 0.001 | 0.999 |
| 0.4315 | 0.432 | 0.001 | 0.999 |
| 0.432 | 0.432 | 0.001 | 0.999 |
| 0.4325 | 0.432 | 0.001 | 0.999 |
| 0.433 | 0.433 | 0.001 | 0.999 |
| 0.4335 | 0.434 | 0.001 | 0.999 |
| 0.434 | 0.434 | 0.001 | 0.999 |
| 0.4345 | 0.434 | 0.001 | 0.999 |
| 0.435 | 0.435 | 0.001 | 0.999 |
| 0.4355 | 0.436 | 0.001 | 0.999 |
| 0.436 | 0.436 | 0.001 | 0.999 |
| 0.4365 | 0.436 | 0.001 | 0.999 |
| 0.437 | 0.437 | 0.001 | 0.999 |
| 0.4375 | 0.438 | 0.001 | 0.999 |
| 0.438 | 0.438 | 0.001 | 0.999 |
| 0.4385 | 0.438 | 0.001 | 0.999 |
| 0.439 | 0.439 | 0.001 | 0.999 |
| 0.4395 | 0.44 | 0.001 | 0.999 |
| 0.44 | 0.44 | 0.001 | 0.999 |
| 0.4405 | 0.44 | 0.001 | 0.999 |
| 0.441 | 0.441 | 0.001 | 0.999 |
| 0.4415 | 0.442 | 0.001 | 0.999 |
| 0.442 | 0.442 | 0.001 | 0.999 |
| 0.4425 | 0.442 | 0.001 | 0.999 |
| 0.443 | 0.443 | 0.001 | 0.999 |
| 0.4435 | 0.444 | 0.001 | 0.999 |
| 0.444 | 0.444 | 0.001 | 0.999 |
| 0.4445 | 0.444 | 0.001 | 0.999 |
| 0.445 | 0.445 | 0.001 | 0.999 |
| 0.4455 | 0.446 | 0.001 | 0.999 |
| 0.446 | 0.446 | 0.001 | 0.999 |
| 0.4465 | 0.446 | 0.001 | 0.999 |
| 0.447 | 0.447 | 0.001 | 0.999 |
| 0.4475 | 0.448 | 0.001 | 0.999 |
| 0.448 | 0.448 | 0.001 | 0.999 |
| 0.4485 | 0.448 | 0.001 | 0.999 |
| 0.449 | 0.449 | 0.001 | 0.999 |
| 0.4495 | 0.45 | 0.001 | 0.999 |
| 0.45 | 0.45 | 0.001 | 0.999 |
| 0.4505 | 0.45 | 0.001 | 0.999 |
| 0.451 | 0.451 | 0.001 | 0.999 |
| 0.4515 | 0.452 | 0.001 | 0.999 |
| 0.452 | 0.452 | 0.001 | 0.999 |
| 0.4525 | 0.452 | 0.001 | 0.999 |
| 0.453 | 0.453 | 0.001 | 0.999 |
| 0.4535 | 0.454 | 0.001 | 0.999 |
| 0.454 | 0.454 | 0.001 | 0.999 |
| 0.4545 | 0.454 | 0.001 | 0.999 |
| 0.455 | 0.455 | 0.001 | 0.999 |
| 0.4555 | 0.456 | 0.001 | 0.999 |
| 0.456 | 0.456 | 0.001 | 0.999 |
| 0.4565 | 0.456 | 0.001 | 0.999 |
| 0.457 | 0.457 | 0.001 | 0.999 |
| 0.4575 | 0.458 | 0.001 | 0.999 |
| 0.458 | 0.458 | 0.001 | 0.999 |
| 0.4585 | 0.458 | 0.001 | 0.999 |
| 0.459 | 0.459 | 0.001 | 0.999 |
| 0.4595 | 0.46 | 0.001 | 0.999 |
| 0.46 | 0.46 | 0.001 | 0.999 |
| 0.4605 | 0.46 | 0.001 | 0.999 |
| 0.461 | 0.461 | 0.001 | 0.999 |
| 0.4615 | 0.462 | 0.001 | 0.999 |
| 0.462 | 0.462 | 0.001 | 0.999 |
| 0.4625 | 0.462 | 0.001 | 0.999 |
| 0.463 | 0.463 | 0.001 | 0.999 |
| 0.4635 | 0.464 | 0.001 | 0.999 |
| 0.464 | 0.464 | 0.001 | 0.999 |
| 0.4645 | 0.464 | 0.001 | 0.999 |
| 0.465 | 0.465 | 0.001 | 0.999 |
| 0.4655 | 0.466 | 0.001 | 0.999 |
| 0.466 | 0.466 | 0.001 | 0.999 |
| 0.4665 | 0.466 | 0.001 | 0.999 |
| 0.467 | 0.467 | 0.001 | 0.999 |
| 0.4675 | 0.468 | 0.001 | 0.999 |
| 0.468 | 0.468 | 0.001 | 0.999 |
| 0.4685 | 0.468 | 0.001 | 0.999 |
| 0.469 | 0.469 | 0.001 | 0.999 |
| 0.4695 | 0.47 | 0.001 | 0.999 |
| 0.47 | 0.47 | 0.001 | 0.999 |
| 0.4705 | 0.47 | 0.001 | 0.999 |
| 0.471 | 0.471 | 0.001 | 0.999 |
| 0.4715 | 0.472 | 0.001 | 0.999 |
| 0.472 | 0.472 | 0.001 | 0.999 |
| 0.4725 | 0.472 | 0.001 | 0.999 |
| 0.473 | 0.473 | 0.001 | 0.999 |
| 0.4735 | 0.474 | 0.001 | 0.999 |
| 0.474 | 0.474 | 0.001 | 0.999 |
| 0.4745 | 0.474 | 0.001 | 0.999 |
| 0.475 | 0.475 | 0.001 | 0.999 |
| 0.4755 | 0.476 | 0.001 | 0.999 |
| 0.476 | 0.476 | 0.001 | 0.999 |
| 0.4765 | 0.476 | 0.001 | 0.999 |
| 0.477 | 0.477 | 0.001 | 0.999 |
| 0.4775 | 0.478 | 0.001 | 0.999 |
| 0.478 | 0.478 | 0.001 | 0.999 |
| 0.4785 | 0.478 | 0.001 | 0.999 |
| 0.479 | 0.479 | 0.001 | 0.999 |
| 0.4795 | 0.48 | 0.001 | 0.999 |
| 0.48 | 0.48 | 0.001 | 0.999 |
| 0.4805 | 0.48 | 0.001 | 0.999 |
| 0.481 | 0.481 | 0.001 | 0.999 |
| 0.4815 | 0.482 | 0.001 | 0.999 |
| 0.482 | 0.482 | 0.001 | 0.999 |
| 0.4825 | 0.482 | 0.001 | 0.999 |
| 0.483 | 0.483 | 0.001 | 0.999 |
| 0.4835 | 0.484 | 0.001 | 0.999 |
| 0.484 | 0.484 | 0.001 | 0.999 |
| 0.4845 | 0.484 | 0.001 | 0.999 |
| 0.485 | 0.485 | 0.001 | 0.999 |
| 0.4855 | 0.486 | 0.001 | 0.999 |
| 0.486 | 0.486 | 0.001 | 0.999 |
| 0.4865 | 0.486 | 0.001 | 0.999 |
| 0.487 | 0.487 | 0.001 | 0.999 |
| 0.4875 | 0.488 | 0.001 | 0.999 |
| 0.488 | 0.488 | 0.001 | 0.999 |
| 0.4885 | 0.488 | 0.001 | 0.999 |
| 0.489 | 0.489 | 0.001 | 0.999 |
| 0.4895 | 0.49 | 0.001 | 0.999 |
| 0.49 | 0.49 | 0.001 | 0.999 |
| 0.4905 | 0.49 | 0.001 | 0.999 |
| 0.491 | 0.491 | 0.001 | 0.999 |
| 0.4915 | 0.492 | 0.001 | 0.999 |
| 0.492 | 0.492 | 0.001 | 0.999 |
| 0.4925 | 0.492 | 0.001 | 0.999 |
| 0.493 | 0.493 | 0.001 | 0.999 |
| 0.4935 | 0.494 | 0.001 | 0.999 |
| 0.494 | 0.494 | 0.001 | 0.999 |
| 0.4945 | 0.494 | 0.001 | 0.999 |
| 0.495 | 0.495 | 0.001 | 0.999 |
| 0.4955 | 0.496 | 0.001 | 0.999 |
| 0.496 | 0.496 | 0.001 | 0.999 |
| 0.4965 | 0.496 | 0.001 | 0.999 |
| 0.497 | 0.497 | 0.001 | 0.999 |
| 0.4975 | 0.498 | 0.001 | 0.999 |
| 0.498 | 0.498 | 0.001 | 0.999 |
| 0.4985 | 0.498 | 0.001 | 0.999 |
| 0.499 | 0.499 | 0.001 | 0.999 |
| 0.4995 | 0.5 | 0.001 | 0.999 |
| 0.5 | 0.5 | 0.001 | 0.999 |
| 0.5005 | 0.5 | 0.001 | 0.999 |
| 0.501 | 0.501 | 0.001 | 0.999 |
| 0.5015 | 0.501 | 0.001 | 0.999 |
| 0.502 | 0.502 | 0.001 | 0.999 |
| 0.5025 | 0.502 | 0.001 | 0.999 |
| 0.503 | 0.503 | 0.001 | 0.999 |
| 0.5035 | 0.503 | 0.001 | 0.999 |
| 0.504 | 0.504 | 0.001 | 0.999 |
| 0.5045 | 0.504 | 0.001 | 0.999 |
| 0.505 | 0.505 | 0.001 | 0.999 |
| 0.5055 | 0.505 | 0.001 | 0.999 |
| 0.506 | 0.506 | 0.001 | 0.999 |
| 0.5065 | 0.506 | 0.001 | 0.999 |
| 0.507 | 0.507 | 0.001 | 0.999 |
| 0.5075 | 0.507 | 0.001 | 0.999 |
| 0.507999999999999 | 0.508 | 0.001 | 0.999 |
| 0.508499999999999 | 0.508 | 0.001 | 0.999 |
| 0.508999999999999 | 0.509 | 0.001 | 0.999 |
| 0.509499999999999 | 0.509 | 0.001 | 0.999 |
| 0.509999999999999 | 0.51 | 0.001 | 0.999 |
| 0.510499999999999 | 0.51 | 0.001 | 0.999 |
| 0.510999999999999 | 0.511 | 0.001 | 0.999 |
| 0.511499999999999 | 0.511 | 0.001 | 0.999 |
| 0.511999999999999 | 0.512 | 0.001 | 0.999 |
| 0.512499999999999 | 0.512 | 0.001 | 0.999 |
| 0.512999999999999 | 0.513 | 0.001 | 0.999 |
| 0.513499999999999 | 0.513 | 0.001 | 0.999 |
| 0.513999999999999 | 0.514 | 0.001 | 0.999 |
| 0.514499999999999 | 0.514 | 0.001 | 0.999 |
| 0.514999999999999 | 0.515 | 0.001 | 0.999 |
| 0.515499999999999 | 0.515 | 0.001 | 0.999 |
| 0.515999999999999 | 0.516 | 0.001 | 0.999 |
| 0.516499999999999 | 0.516 | 0.001 | 0.999 |
| 0.516999999999998 | 0.517 | 0.001 | 0.999 |
| 0.517499999999998 | 0.517 | 0.001 | 0.999 |
| 0.517999999999998 | 0.518 | 0.001 | 0.999 |
| 0.518499999999998 | 0.518 | 0.001 | 0.999 |
| 0.518999999999998 | 0.519 | 0.001 | 0.999 |
| 0.519499999999998 | 0.519 | 0.001 | 0.999 |
| 0.519999999999998 | 0.52 | 0.001 | 0.999 |
| 0.520499999999998 | 0.52 | 0.001 | 0.999 |
| 0.520999999999998 | 0.521 | 0.001 | 0.999 |
| 0.521499999999998 | 0.521 | 0.001 | 0.999 |
| 0.521999999999998 | 0.522 | 0.001 | 0.999 |
| 0.522499999999998 | 0.522 | 0.001 | 0.999 |
| 0.522999999999998 | 0.523 | 0.001 | 0.999 |
| 0.523499999999998 | 0.523 | 0.001 | 0.999 |
| 0.523999999999998 | 0.524 | 0.001 | 0.999 |
| 0.524499999999998 | 0.524 | 0.001 | 0.999 |
| 0.524999999999998 | 0.525 | 0.001 | 0.999 |
| 0.525499999999998 | 0.525 | 0.001 | 0.999 |
| 0.525999999999997 | 0.526 | 0.001 | 0.999 |
| 0.526499999999997 | 0.526 | 0.001 | 0.999 |
| 0.526999999999997 | 0.527 | 0.001 | 0.999 |
| 0.527499999999997 | 0.527 | 0.001 | 0.999 |
| 0.527999999999997 | 0.528 | 0.001 | 0.999 |
| 0.528499999999997 | 0.528 | 0.001 | 0.999 |
| 0.528999999999997 | 0.529 | 0.001 | 0.999 |
| 0.529499999999997 | 0.529 | 0.001 | 0.999 |
| 0.529999999999997 | 0.53 | 0.001 | 0.999 |
| 0.530499999999997 | 0.53 | 0.001 | 0.999 |
| 0.530999999999997 | 0.531 | 0.001 | 0.999 |
| 0.531499999999997 | 0.531 | 0.001 | 0.999 |
| 0.531999999999997 | 0.532 | 0.001 | 0.999 |
| 0.532499999999997 | 0.532 | 0.001 | 0.999 |
| 0.532999999999997 | 0.533 | 0.001 | 0.999 |
| 0.533499999999997 | 0.533 | 0.001 | 0.999 |
| 0.533999999999997 | 0.534 | 0.001 | 0.999 |
| 0.534499999999997 | 0.534 | 0.001 | 0.999 |
| 0.534999999999996 | 0.535 | 0.001 | 0.999 |
| 0.535499999999996 | 0.535 | 0.001 | 0.999 |
| 0.535999999999996 | 0.536 | 0.001 | 0.999 |
| 0.536499999999996 | 0.536 | 0.001 | 0.999 |
| 0.536999999999996 | 0.537 | 0.001 | 0.999 |
| 0.537499999999996 | 0.537 | 0.001 | 0.999 |
| 0.537999999999996 | 0.538 | 0.001 | 0.999 |
| 0.538499999999996 | 0.538 | 0.001 | 0.999 |
| 0.538999999999996 | 0.539 | 0.001 | 0.999 |
| 0.539499999999996 | 0.539 | 0.001 | 0.999 |
| 0.539999999999996 | 0.54 | 0.001 | 0.999 |
| 0.540499999999996 | 0.54 | 0.001 | 0.999 |
| 0.540999999999996 | 0.541 | 0.001 | 0.999 |
| 0.541499999999996 | 0.541 | 0.001 | 0.999 |
| 0.541999999999996 | 0.542 | 0.001 | 0.999 |
| 0.542499999999996 | 0.542 | 0.001 | 0.999 |
| 0.542999999999996 | 0.543 | 0.001 | 0.999 |
| 0.543499999999996 | 0.543 | 0.001 | 0.999 |
| 0.543999999999995 | 0.544 | 0.001 | 0.999 |
| 0.544499999999995 | 0.544 | 0.001 | 0.999 |
| 0.544999999999995 | 0.545 | 0.001 | 0.999 |
| 0.545499999999995 | 0.545 | 0.001 | 0.999 |
| 0.545999999999995 | 0.546 | 0.001 | 0.999 |
| 0.546499999999995 | 0.546 | 0.001 | 0.999 |
| 0.546999999999995 | 0.547 | 0.001 | 0.999 |
| 0.547499999999995 | 0.547 | 0.001 | 0.999 |
| 0.547999999999995 | 0.548 | 0.001 | 0.999 |
| 0.548499999999995 | 0.548 | 0.001 | 0.999 |
| 0.548999999999995 | 0.549 | 0.001 | 0.999 |
| 0.549499999999995 | 0.549 | 0.001 | 0.999 |
| 0.549999999999995 | 0.55 | 0.001 | 0.999 |
| 0.550499999999995 | 0.55 | 0.001 | 0.999 |
| 0.550999999999995 | 0.551 | 0.001 | 0.999 |
| 0.551499999999995 | 0.551 | 0.001 | 0.999 |
| 0.551999999999995 | 0.552 | 0.001 | 0.999 |
| 0.552499999999995 | 0.552 | 0.001 | 0.999 |
| 0.552999999999994 | 0.553 | 0.001 | 0.999 |
| 0.553499999999994 | 0.553 | 0.001 | 0.999 |
| 0.553999999999994 | 0.554 | 0.001 | 0.999 |
| 0.554499999999994 | 0.554 | 0.001 | 0.999 |
| 0.554999999999994 | 0.555 | 0.001 | 0.999 |
| 0.555499999999994 | 0.555 | 0.001 | 0.999 |
| 0.555999999999994 | 0.556 | 0.001 | 0.999 |
| 0.556499999999994 | 0.556 | 0.001 | 0.999 |
| 0.556999999999994 | 0.557 | 0.001 | 0.999 |
| 0.557499999999994 | 0.557 | 0.001 | 0.999 |
| 0.557999999999994 | 0.558 | 0.001 | 0.999 |
| 0.558499999999994 | 0.558 | 0.001 | 0.999 |
| 0.558999999999994 | 0.559 | 0.001 | 0.999 |
| 0.559499999999994 | 0.559 | 0.001 | 0.999 |
| 0.559999999999994 | 0.56 | 0.001 | 0.999 |
| 0.560499999999994 | 0.56 | 0.001 | 0.999 |
| 0.560999999999994 | 0.561 | 0.001 | 0.999 |
| 0.561499999999994 | 0.561 | 0.001 | 0.999 |
| 0.561999999999993 | 0.562 | 0.001 | 0.999 |
| 0.562499999999993 | 0.562 | 0.001 | 0.999 |
| 0.562999999999993 | 0.563 | 0.001 | 0.999 |
| 0.563499999999993 | 0.563 | 0.001 | 0.999 |
| 0.563999999999993 | 0.564 | 0.001 | 0.999 |
| 0.564499999999993 | 0.564 | 0.001 | 0.999 |
| 0.564999999999993 | 0.565 | 0.001 | 0.999 |
| 0.565499999999993 | 0.565 | 0.001 | 0.999 |
| 0.565999999999993 | 0.566 | 0.001 | 0.999 |
| 0.566499999999993 | 0.566 | 0.001 | 0.999 |
| 0.566999999999993 | 0.567 | 0.001 | 0.999 |
| 0.567499999999993 | 0.567 | 0.001 | 0.999 |
| 0.567999999999993 | 0.568 | 0.001 | 0.999 |
| 0.568499999999993 | 0.568 | 0.001 | 0.999 |
| 0.568999999999993 | 0.569 | 0.001 | 0.999 |
| 0.569499999999993 | 0.569 | 0.001 | 0.999 |
| 0.569999999999993 | 0.57 | 0.001 | 0.999 |
| 0.570499999999993 | 0.57 | 0.001 | 0.999 |
| 0.570999999999993 | 0.571 | 0.001 | 0.999 |
| 0.571499999999992 | 0.571 | 0.001 | 0.999 |
| 0.571999999999992 | 0.572 | 0.001 | 0.999 |
| 0.572499999999992 | 0.572 | 0.001 | 0.999 |
| 0.572999999999992 | 0.573 | 0.001 | 0.999 |
| 0.573499999999992 | 0.573 | 0.001 | 0.999 |
| 0.573999999999992 | 0.574 | 0.001 | 0.999 |
| 0.574499999999992 | 0.574 | 0.001 | 0.999 |
| 0.574999999999992 | 0.575 | 0.001 | 0.999 |
| 0.575499999999992 | 0.575 | 0.001 | 0.999 |
| 0.575999999999992 | 0.576 | 0.001 | 0.999 |
| 0.576499999999992 | 0.576 | 0.001 | 0.999 |
| 0.576999999999992 | 0.577 | 0.001 | 0.999 |
| 0.577499999999992 | 0.577 | 0.001 | 0.999 |
| 0.577999999999992 | 0.578 | 0.001 | 0.999 |
| 0.578499999999992 | 0.578 | 0.001 | 0.999 |
| 0.578999999999992 | 0.579 | 0.001 | 0.999 |
| 0.579499999999992 | 0.579 | 0.001 | 0.999 |
| 0.579999999999992 | 0.58 | 0.001 | 0.999 |
| 0.580499999999991 | 0.58 | 0.001 | 0.999 |
| 0.580999999999991 | 0.581 | 0.001 | 0.999 |
| 0.581499999999991 | 0.581 | 0.001 | 0.999 |
| 0.581999999999991 | 0.582 | 0.001 | 0.999 |
| 0.582499999999991 | 0.582 | 0.001 | 0.999 |
| 0.582999999999991 | 0.583 | 0.001 | 0.999 |
| 0.583499999999991 | 0.583 | 0.001 | 0.999 |
| 0.583999999999991 | 0.584 | 0.001 | 0.999 |
| 0.584499999999991 | 0.584 | 0.001 | 0.999 |
| 0.584999999999991 | 0.585 | 0.001 | 0.999 |
| 0.585499999999991 | 0.585 | 0.001 | 0.999 |
| 0.585999999999991 | 0.586 | 0.001 | 0.999 |
| 0.586499999999991 | 0.586 | 0.001 | 0.999 |
| 0.586999999999991 | 0.587 | 0.001 | 0.999 |
| 0.587499999999991 | 0.587 | 0.001 | 0.999 |
| 0.587999999999991 | 0.588 | 0.001 | 0.999 |
| 0.588499999999991 | 0.588 | 0.001 | 0.999 |
| 0.588999999999991 | 0.589 | 0.001 | 0.999 |
| 0.58949999999999 | 0.589 | 0.001 | 0.999 |
| 0.58999999999999 | 0.59 | 0.001 | 0.999 |
| 0.59049999999999 | 0.59 | 0.001 | 0.999 |
| 0.59099999999999 | 0.591 | 0.001 | 0.999 |
| 0.59149999999999 | 0.591 | 0.001 | 0.999 |
| 0.59199999999999 | 0.592 | 0.001 | 0.999 |
| 0.59249999999999 | 0.592 | 0.001 | 0.999 |
| 0.59299999999999 | 0.593 | 0.001 | 0.999 |
| 0.59349999999999 | 0.593 | 0.001 | 0.999 |
| 0.59399999999999 | 0.594 | 0.001 | 0.999 |
| 0.59449999999999 | 0.594 | 0.001 | 0.999 |
| 0.59499999999999 | 0.595 | 0.001 | 0.999 |
| 0.59549999999999 | 0.595 | 0.001 | 0.999 |
| 0.59599999999999 | 0.596 | 0.001 | 0.999 |
| 0.59649999999999 | 0.596 | 0.001 | 0.999 |
| 0.59699999999999 | 0.597 | 0.001 | 0.999 |
| 0.59749999999999 | 0.597 | 0.001 | 0.999 |
| 0.59799999999999 | 0.598 | 0.001 | 0.999 |
| 0.598499999999989 | 0.598 | 0.001 | 0.999 |
| 0.598999999999989 | 0.599 | 0.001 | 0.999 |
| 0.599499999999989 | 0.599 | 0.001 | 0.999 |
| 0.599999999999989 | 0.6 | 0.001 | 0.999 |
| 0.600499999999989 | 0.6 | 0.001 | 0.999 |
| 0.600999999999989 | 0.601 | 0.001 | 0.999 |
| 0.601499999999989 | 0.601 | 0.001 | 0.999 |
| 0.601999999999989 | 0.602 | 0.001 | 0.999 |
| 0.602499999999989 | 0.602 | 0.001 | 0.999 |
| 0.602999999999989 | 0.603 | 0.001 | 0.999 |
| 0.603499999999989 | 0.603 | 0.001 | 0.999 |
| 0.603999999999989 | 0.604 | 0.001 | 0.999 |
| 0.604499999999989 | 0.604 | 0.001 | 0.999 |
| 0.604999999999989 | 0.605 | 0.001 | 0.999 |
| 0.605499999999989 | 0.605 | 0.001 | 0.999 |
| 0.605999999999989 | 0.606 | 0.001 | 0.999 |
| 0.606499999999989 | 0.606 | 0.001 | 0.999 |
| 0.606999999999988 | 0.607 | 0.001 | 0.999 |
| 0.607499999999988 | 0.607 | 0.001 | 0.999 |
| 0.607999999999988 | 0.608 | 0.001 | 0.999 |
| 0.608499999999988 | 0.608 | 0.001 | 0.999 |
| 0.608999999999988 | 0.609 | 0.001 | 0.999 |
| 0.609499999999988 | 0.609 | 0.001 | 0.999 |
| 0.609999999999988 | 0.61 | 0.001 | 0.999 |
| 0.610499999999988 | 0.61 | 0.001 | 0.999 |
| 0.610999999999988 | 0.611 | 0.001 | 0.999 |
| 0.611499999999988 | 0.611 | 0.001 | 0.999 |
| 0.611999999999988 | 0.612 | 0.001 | 0.999 |
| 0.612499999999988 | 0.612 | 0.001 | 0.999 |
| 0.612999999999988 | 0.613 | 0.001 | 0.999 |
| 0.613499999999988 | 0.613 | 0.001 | 0.999 |
| 0.613999999999988 | 0.614 | 0.001 | 0.999 |
| 0.614499999999988 | 0.614 | 0.001 | 0.999 |
| 0.614999999999988 | 0.615 | 0.001 | 0.999 |
| 0.615499999999988 | 0.615 | 0.001 | 0.999 |
| 0.615999999999987 | 0.616 | 0.001 | 0.999 |
| 0.616499999999987 | 0.616 | 0.001 | 0.999 |
| 0.616999999999987 | 0.617 | 0.001 | 0.999 |
| 0.617499999999987 | 0.617 | 0.001 | 0.999 |
| 0.617999999999987 | 0.618 | 0.001 | 0.999 |
| 0.618499999999987 | 0.618 | 0.001 | 0.999 |
| 0.618999999999987 | 0.619 | 0.001 | 0.999 |
| 0.619499999999987 | 0.619 | 0.001 | 0.999 |
| 0.619999999999987 | 0.62 | 0.001 | 0.999 |
| 0.620499999999987 | 0.62 | 0.001 | 0.999 |
| 0.620999999999987 | 0.621 | 0.001 | 0.999 |
| 0.621499999999987 | 0.621 | 0.001 | 0.999 |
| 0.621999999999987 | 0.622 | 0.001 | 0.999 |
| 0.622499999999987 | 0.622 | 0.001 | 0.999 |
| 0.622999999999987 | 0.623 | 0.001 | 0.999 |
| 0.623499999999987 | 0.623 | 0.001 | 0.999 |
| 0.623999999999987 | 0.624 | 0.001 | 0.999 |
| 0.624499999999987 | 0.624 | 0.001 | 0.999 |
| 0.624999999999986 | 0.625 | 0.001 | 0.999 |
| 0.625499999999986 | 0.625 | 0.001 | 0.999 |
| 0.625999999999986 | 0.626 | 0.001 | 0.999 |
| 0.626499999999986 | 0.626 | 0.001 | 0.999 |
| 0.626999999999986 | 0.627 | 0.001 | 0.999 |
| 0.627499999999986 | 0.627 | 0.001 | 0.999 |
| 0.627999999999986 | 0.628 | 0.001 | 0.999 |
| 0.628499999999986 | 0.628 | 0.001 | 0.999 |
| 0.628999999999986 | 0.629 | 0.001 | 0.999 |
| 0.629499999999986 | 0.629 | 0.001 | 0.999 |
| 0.629999999999986 | 0.63 | 0.001 | 0.999 |
| 0.630499999999986 | 0.63 | 0.001 | 0.999 |
| 0.630999999999986 | 0.631 | 0.001 | 0.999 |
| 0.631499999999986 | 0.631 | 0.001 | 0.999 |
| 0.631999999999986 | 0.632 | 0.001 | 0.999 |
| 0.632499999999986 | 0.632 | 0.001 | 0.999 |
| 0.632999999999986 | 0.633 | 0.001 | 0.999 |
| 0.633499999999986 | 0.633 | 0.001 | 0.999 |
| 0.633999999999985 | 0.634 | 0.001 | 0.999 |
| 0.634499999999985 | 0.634 | 0.001 | 0.999 |
| 0.634999999999985 | 0.635 | 0.001 | 0.999 |
| 0.635499999999985 | 0.635 | 0.001 | 0.999 |
| 0.635999999999985 | 0.636 | 0.001 | 0.999 |
| 0.636499999999985 | 0.636 | 0.001 | 0.999 |
| 0.636999999999985 | 0.637 | 0.001 | 0.999 |
| 0.637499999999985 | 0.637 | 0.001 | 0.999 |
| 0.637999999999985 | 0.638 | 0.001 | 0.999 |
| 0.638499999999985 | 0.638 | 0.001 | 0.999 |
| 0.638999999999985 | 0.639 | 0.001 | 0.999 |
| 0.639499999999985 | 0.639 | 0.001 | 0.999 |
| 0.639999999999985 | 0.64 | 0.001 | 0.999 |
| 0.640499999999985 | 0.64 | 0.001 | 0.999 |
| 0.640999999999985 | 0.641 | 0.001 | 0.999 |
| 0.641499999999985 | 0.641 | 0.001 | 0.999 |
| 0.641999999999985 | 0.642 | 0.001 | 0.999 |
| 0.642499999999985 | 0.642 | 0.001 | 0.999 |
| 0.642999999999984 | 0.643 | 0.001 | 0.999 |
| 0.643499999999984 | 0.643 | 0.001 | 0.999 |
| 0.643999999999984 | 0.644 | 0.001 | 0.999 |
| 0.644499999999984 | 0.644 | 0.001 | 0.999 |
| 0.644999999999984 | 0.645 | 0.001 | 0.999 |
| 0.645499999999984 | 0.645 | 0.001 | 0.999 |
| 0.645999999999984 | 0.646 | 0.001 | 0.999 |
| 0.646499999999984 | 0.646 | 0.001 | 0.999 |
| 0.646999999999984 | 0.647 | 0.001 | 0.999 |
| 0.647499999999984 | 0.647 | 0.001 | 0.999 |
| 0.647999999999984 | 0.648 | 0.001 | 0.999 |
| 0.648499999999984 | 0.648 | 0.001 | 0.999 |
| 0.648999999999984 | 0.649 | 0.001 | 0.999 |
| 0.649499999999984 | 0.649 | 0.001 | 0.999 |
| 0.649999999999984 | 0.65 | 0.001 | 0.999 |
| 0.650499999999984 | 0.65 | 0.001 | 0.999 |
| 0.650999999999984 | 0.651 | 0.001 | 0.999 |
| 0.651499999999984 | 0.651 | 0.001 | 0.999 |
| 0.651999999999983 | 0.652 | 0.001 | 0.999 |
| 0.652499999999983 | 0.652 | 0.001 | 0.999 |
| 0.652999999999983 | 0.653 | 0.001 | 0.999 |
| 0.653499999999983 | 0.653 | 0.001 | 0.999 |
| 0.653999999999983 | 0.654 | 0.001 | 0.999 |
| 0.654499999999983 | 0.654 | 0.001 | 0.999 |
| 0.654999999999983 | 0.655 | 0.001 | 0.999 |
| 0.655499999999983 | 0.655 | 0.001 | 0.999 |
| 0.655999999999983 | 0.656 | 0.001 | 0.999 |
| 0.656499999999983 | 0.656 | 0.001 | 0.999 |
| 0.656999999999983 | 0.657 | 0.001 | 0.999 |
| 0.657499999999983 | 0.657 | 0.001 | 0.999 |
| 0.657999999999983 | 0.658 | 0.001 | 0.999 |
| 0.658499999999983 | 0.658 | 0.001 | 0.999 |
| 0.658999999999983 | 0.659 | 0.001 | 0.999 |
| 0.659499999999983 | 0.659 | 0.001 | 0.999 |
| 0.659999999999983 | 0.66 | 0.001 | 0.999 |
| 0.660499999999983 | 0.66 | 0.001 | 0.999 |
| 0.660999999999983 | 0.661 | 0.001 | 0.999 |
| 0.661499999999982 | 0.661 | 0.001 | 0.999 |
| 0.661999999999982 | 0.662 | 0.001 | 0.999 |
| 0.662499999999982 | 0.662 | 0.001 | 0.999 |
| 0.662999999999982 | 0.663 | 0.001 | 0.999 |
| 0.663499999999982 | 0.663 | 0.001 | 0.999 |
| 0.663999999999982 | 0.664 | 0.001 | 0.999 |
| 0.664499999999982 | 0.664 | 0.001 | 0.999 |
| 0.664999999999982 | 0.665 | 0.001 | 0.999 |
| 0.665499999999982 | 0.665 | 0.001 | 0.999 |
| 0.665999999999982 | 0.666 | 0.001 | 0.999 |
| 0.666499999999982 | 0.666 | 0.001 | 0.999 |
| 0.666999999999982 | 0.667 | 0.001 | 0.999 |
| 0.667499999999982 | 0.667 | 0.001 | 0.999 |
| 0.667999999999982 | 0.668 | 0.001 | 0.999 |
| 0.668499999999982 | 0.668 | 0.001 | 0.999 |
| 0.668999999999982 | 0.669 | 0.001 | 0.999 |
| 0.669499999999982 | 0.669 | 0.001 | 0.999 |
| 0.669999999999982 | 0.67 | 0.001 | 0.999 |
| 0.670499999999981 | 0.67 | 0.001 | 0.999 |
| 0.670999999999981 | 0.671 | 0.001 | 0.999 |
| 0.671499999999981 | 0.671 | 0.001 | 0.999 |
| 0.671999999999981 | 0.672 | 0.001 | 0.999 |
| 0.672499999999981 | 0.672 | 0.001 | 0.999 |
| 0.672999999999981 | 0.673 | 0.001 | 0.999 |
| 0.673499999999981 | 0.673 | 0.001 | 0.999 |
| 0.673999999999981 | 0.674 | 0.001 | 0.999 |
| 0.674499999999981 | 0.674 | 0.001 | 0.999 |
| 0.674999999999981 | 0.675 | 0.001 | 0.999 |
| 0.675499999999981 | 0.675 | 0.001 | 0.999 |
| 0.675999999999981 | 0.676 | 0.001 | 0.999 |
| 0.676499999999981 | 0.676 | 0.001 | 0.999 |
| 0.676999999999981 | 0.677 | 0.001 | 0.999 |
| 0.677499999999981 | 0.677 | 0.001 | 0.999 |
| 0.677999999999981 | 0.678 | 0.001 | 0.999 |
| 0.678499999999981 | 0.678 | 0.001 | 0.999 |
| 0.678999999999981 | 0.679 | 0.001 | 0.999 |
| 0.67949999999998 | 0.679 | 0.001 | 0.999 |
| 0.67999999999998 | 0.68 | 0.001 | 0.999 |
| 0.68049999999998 | 0.68 | 0.001 | 0.999 |
| 0.68099999999998 | 0.681 | 0.001 | 0.999 |
| 0.68149999999998 | 0.681 | 0.001 | 0.999 |
| 0.68199999999998 | 0.682 | 0.001 | 0.999 |
| 0.68249999999998 | 0.682 | 0.001 | 0.999 |
| 0.68299999999998 | 0.683 | 0.001 | 0.999 |
| 0.68349999999998 | 0.683 | 0.001 | 0.999 |
| 0.68399999999998 | 0.684 | 0.001 | 0.999 |
| 0.68449999999998 | 0.684 | 0.001 | 0.999 |
| 0.68499999999998 | 0.685 | 0.001 | 0.999 |
| 0.68549999999998 | 0.685 | 0.001 | 0.999 |
| 0.68599999999998 | 0.686 | 0.001 | 0.999 |
| 0.68649999999998 | 0.686 | 0.001 | 0.999 |
| 0.68699999999998 | 0.687 | 0.001 | 0.999 |
| 0.68749999999998 | 0.687 | 0.001 | 0.999 |
| 0.68799999999998 | 0.688 | 0.001 | 0.999 |
| 0.688499999999979 | 0.688 | 0.001 | 0.999 |
| 0.688999999999979 | 0.689 | 0.001 | 0.999 |
| 0.689499999999979 | 0.689 | 0.001 | 0.999 |
| 0.689999999999979 | 0.69 | 0.001 | 0.999 |
| 0.690499999999979 | 0.69 | 0.001 | 0.999 |
| 0.690999999999979 | 0.691 | 0.001 | 0.999 |
| 0.691499999999979 | 0.691 | 0.001 | 0.999 |
| 0.691999999999979 | 0.692 | 0.001 | 0.999 |
| 0.692499999999979 | 0.692 | 0.001 | 0.999 |
| 0.692999999999979 | 0.693 | 0.001 | 0.999 |
| 0.693499999999979 | 0.693 | 0.001 | 0.999 |
| 0.693999999999979 | 0.694 | 0.001 | 0.999 |
| 0.694499999999979 | 0.694 | 0.001 | 0.999 |
| 0.694999999999979 | 0.695 | 0.001 | 0.999 |
| 0.695499999999979 | 0.695 | 0.001 | 0.999 |
| 0.695999999999979 | 0.696 | 0.001 | 0.999 |
| 0.696499999999979 | 0.696 | 0.001 | 0.999 |
| 0.696999999999979 | 0.697 | 0.001 | 0.999 |
| 0.697499999999978 | 0.697 | 0.001 | 0.999 |
| 0.697999999999978 | 0.698 | 0.001 | 0.999 |
| 0.698499999999978 | 0.698 | 0.001 | 0.999 |
| 0.698999999999978 | 0.699 | 0.001 | 0.999 |
| 0.699499999999978 | 0.699 | 0.001 | 0.999 |
| 0.699999999999978 | 0.7 | 0.001 | 0.999 |
| 0.700499999999978 | 0.7 | 0.001 | 0.999 |
| 0.700999999999978 | 0.701 | 0.001 | 0.999 |
| 0.701499999999978 | 0.701 | 0.001 | 0.999 |
| 0.701999999999978 | 0.702 | 0.001 | 0.999 |
| 0.702499999999978 | 0.702 | 0.001 | 0.999 |
| 0.702999999999978 | 0.703 | 0.001 | 0.999 |
| 0.703499999999978 | 0.703 | 0.001 | 0.999 |
| 0.703999999999978 | 0.704 | 0.001 | 0.999 |
| 0.704499999999978 | 0.704 | 0.001 | 0.999 |
| 0.704999999999978 | 0.705 | 0.001 | 0.999 |
| 0.705499999999978 | 0.705 | 0.001 | 0.999 |
| 0.705999999999978 | 0.706 | 0.001 | 0.999 |
| 0.706499999999978 | 0.706 | 0.001 | 0.999 |
| 0.706999999999977 | 0.707 | 0.001 | 0.999 |
| 0.707499999999977 | 0.707 | 0.001 | 0.999 |
| 0.707999999999977 | 0.708 | 0.001 | 0.999 |
| 0.708499999999977 | 0.708 | 0.001 | 0.999 |
| 0.708999999999977 | 0.709 | 0.001 | 0.999 |
| 0.709499999999977 | 0.709 | 0.001 | 0.999 |
| 0.709999999999977 | 0.71 | 0.001 | 0.999 |
| 0.710499999999977 | 0.71 | 0.001 | 0.999 |
| 0.710999999999977 | 0.711 | 0.001 | 0.999 |
| 0.711499999999977 | 0.711 | 0.001 | 0.999 |
| 0.711999999999977 | 0.712 | 0.001 | 0.999 |
| 0.712499999999977 | 0.712 | 0.001 | 0.999 |
| 0.712999999999977 | 0.713 | 0.001 | 0.999 |
| 0.713499999999977 | 0.713 | 0.001 | 0.999 |
| 0.713999999999977 | 0.714 | 0.001 | 0.999 |
| 0.714499999999977 | 0.714 | 0.001 | 0.999 |
| 0.714999999999977 | 0.715 | 0.001 | 0.999 |
| 0.715499999999977 | 0.715 | 0.001 | 0.999 |
| 0.715999999999976 | 0.716 | 0.001 | 0.999 |
| 0.716499999999976 | 0.716 | 0.001 | 0.999 |
| 0.716999999999976 | 0.717 | 0.001 | 0.999 |
| 0.717499999999976 | 0.717 | 0.001 | 0.999 |
| 0.717999999999976 | 0.718 | 0.001 | 0.999 |
| 0.718499999999976 | 0.718 | 0.001 | 0.999 |
| 0.718999999999976 | 0.719 | 0.001 | 0.999 |
| 0.719499999999976 | 0.719 | 0.001 | 0.999 |
| 0.719999999999976 | 0.72 | 0.001 | 0.999 |
| 0.720499999999976 | 0.72 | 0.001 | 0.999 |
| 0.720999999999976 | 0.721 | 0.001 | 0.999 |
| 0.721499999999976 | 0.721 | 0.001 | 0.999 |
| 0.721999999999976 | 0.722 | 0.001 | 0.999 |
| 0.722499999999976 | 0.722 | 0.001 | 0.999 |
| 0.722999999999976 | 0.723 | 0.001 | 0.999 |
| 0.723499999999976 | 0.723 | 0.001 | 0.999 |
| 0.723999999999976 | 0.724 | 0.001 | 0.999 |
| 0.724499999999976 | 0.724 | 0.001 | 0.999 |
| 0.724999999999975 | 0.725 | 0.001 | 0.999 |
| 0.725499999999975 | 0.725 | 0.001 | 0.999 |
| 0.725999999999975 | 0.726 | 0.001 | 0.999 |
| 0.726499999999975 | 0.726 | 0.001 | 0.999 |
| 0.726999999999975 | 0.727 | 0.001 | 0.999 |
| 0.727499999999975 | 0.727 | 0.001 | 0.999 |
| 0.727999999999975 | 0.728 | 0.001 | 0.999 |
| 0.728499999999975 | 0.728 | 0.001 | 0.999 |
| 0.728999999999975 | 0.729 | 0.001 | 0.999 |
| 0.729499999999975 | 0.729 | 0.001 | 0.999 |
| 0.729999999999975 | 0.73 | 0.001 | 0.999 |
| 0.730499999999975 | 0.73 | 0.001 | 0.999 |
| 0.730999999999975 | 0.731 | 0.001 | 0.999 |
| 0.731499999999975 | 0.731 | 0.001 | 0.999 |
| 0.731999999999975 | 0.732 | 0.001 | 0.999 |
| 0.732499999999975 | 0.732 | 0.001 | 0.999 |
| 0.732999999999975 | 0.733 | 0.001 | 0.999 |
| 0.733499999999975 | 0.733 | 0.001 | 0.999 |
| 0.733999999999974 | 0.734 | 0.001 | 0.999 |
| 0.734499999999974 | 0.734 | 0.001 | 0.999 |
| 0.734999999999974 | 0.735 | 0.001 | 0.999 |
| 0.735499999999974 | 0.735 | 0.001 | 0.999 |
| 0.735999999999974 | 0.736 | 0.001 | 0.999 |
| 0.736499999999974 | 0.736 | 0.001 | 0.999 |
| 0.736999999999974 | 0.737 | 0.001 | 0.999 |
| 0.737499999999974 | 0.737 | 0.001 | 0.999 |
| 0.737999999999974 | 0.738 | 0.001 | 0.999 |
| 0.738499999999974 | 0.738 | 0.001 | 0.999 |
| 0.738999999999974 | 0.739 | 0.001 | 0.999 |
| 0.739499999999974 | 0.739 | 0.001 | 0.999 |
| 0.739999999999974 | 0.74 | 0.001 | 0.999 |
| 0.740499999999974 | 0.74 | 0.001 | 0.999 |
| 0.740999999999974 | 0.741 | 0.001 | 0.999 |
| 0.741499999999974 | 0.741 | 0.001 | 0.999 |
| 0.741999999999974 | 0.742 | 0.001 | 0.999 |
| 0.742499999999974 | 0.742 | 0.001 | 0.999 |
| 0.742999999999973 | 0.743 | 0.001 | 0.999 |
| 0.743499999999973 | 0.743 | 0.001 | 0.999 |
| 0.743999999999973 | 0.744 | 0.001 | 0.999 |
| 0.744499999999973 | 0.744 | 0.001 | 0.999 |
| 0.744999999999973 | 0.745 | 0.001 | 0.999 |
| 0.745499999999973 | 0.745 | 0.001 | 0.999 |
| 0.745999999999973 | 0.746 | 0.001 | 0.999 |
| 0.746499999999973 | 0.746 | 0.001 | 0.999 |
| 0.746999999999973 | 0.747 | 0.001 | 0.999 |
| 0.747499999999973 | 0.747 | 0.001 | 0.999 |
| 0.747999999999973 | 0.748 | 0.001 | 0.999 |
| 0.748499999999973 | 0.748 | 0.001 | 0.999 |
| 0.748999999999973 | 0.749 | 0.001 | 0.999 |
| 0.749499999999973 | 0.749 | 0.001 | 0.999 |
| 0.749999999999973 | 0.75 | 0.001 | 0.999 |
| 0.750499999999973 | 0.75 | 0.001 | 0.999 |
| 0.750999999999973 | 0.751 | 0.001 | 0.999 |
| 0.751499999999973 | 0.751 | 0.001 | 0.999 |
| 0.751999999999973 | 0.752 | 0.001 | 0.999 |
| 0.752499999999972 | 0.752 | 0.001 | 0.999 |
| 0.752999999999972 | 0.753 | 0.001 | 0.999 |
| 0.753499999999972 | 0.753 | 0.001 | 0.999 |
| 0.753999999999972 | 0.754 | 0.001 | 0.999 |
| 0.754499999999972 | 0.754 | 0.001 | 0.999 |
| 0.754999999999972 | 0.755 | 0.001 | 0.999 |
| 0.755499999999972 | 0.755 | 0.001 | 0.999 |
| 0.755999999999972 | 0.756 | 0.001 | 0.999 |
| 0.756499999999972 | 0.756 | 0.001 | 0.999 |
| 0.756999999999972 | 0.757 | 0.001 | 0.999 |
| 0.757499999999972 | 0.757 | 0.001 | 0.999 |
| 0.757999999999972 | 0.758 | 0.001 | 0.999 |
| 0.758499999999972 | 0.758 | 0.001 | 0.999 |
| 0.758999999999972 | 0.759 | 0.001 | 0.999 |
| 0.759499999999972 | 0.759 | 0.001 | 0.999 |
| 0.759999999999972 | 0.76 | 0.001 | 0.999 |
| 0.760499999999972 | 0.76 | 0.001 | 0.999 |
| 0.760999999999972 | 0.761 | 0.001 | 0.999 |
| 0.761499999999971 | 0.761 | 0.001 | 0.999 |
| 0.761999999999971 | 0.762 | 0.001 | 0.999 |
| 0.762499999999971 | 0.762 | 0.001 | 0.999 |
| 0.762999999999971 | 0.763 | 0.001 | 0.999 |
| 0.763499999999971 | 0.763 | 0.001 | 0.999 |
| 0.763999999999971 | 0.764 | 0.001 | 0.999 |
| 0.764499999999971 | 0.764 | 0.001 | 0.999 |
| 0.764999999999971 | 0.765 | 0.001 | 0.999 |
| 0.765499999999971 | 0.765 | 0.001 | 0.999 |
| 0.765999999999971 | 0.766 | 0.001 | 0.999 |
| 0.766499999999971 | 0.766 | 0.001 | 0.999 |
| 0.766999999999971 | 0.767 | 0.001 | 0.999 |
| 0.767499999999971 | 0.767 | 0.001 | 0.999 |
| 0.767999999999971 | 0.768 | 0.001 | 0.999 |
| 0.768499999999971 | 0.768 | 0.001 | 0.999 |
| 0.768999999999971 | 0.769 | 0.001 | 0.999 |
| 0.769499999999971 | 0.769 | 0.001 | 0.999 |
| 0.769999999999971 | 0.77 | 0.001 | 0.999 |
| 0.77049999999997 | 0.77 | 0.001 | 0.999 |
| 0.77099999999997 | 0.771 | 0.001 | 0.999 |
| 0.77149999999997 | 0.771 | 0.001 | 0.999 |
| 0.77199999999997 | 0.772 | 0.001 | 0.999 |
| 0.77249999999997 | 0.772 | 0.001 | 0.999 |
| 0.77299999999997 | 0.773 | 0.001 | 0.999 |
| 0.77349999999997 | 0.773 | 0.001 | 0.999 |
| 0.77399999999997 | 0.774 | 0.001 | 0.999 |
| 0.77449999999997 | 0.774 | 0.001 | 0.999 |
| 0.77499999999997 | 0.775 | 0.001 | 0.999 |
| 0.77549999999997 | 0.775 | 0.001 | 0.999 |
| 0.77599999999997 | 0.776 | 0.001 | 0.999 |
| 0.77649999999997 | 0.776 | 0.001 | 0.999 |
| 0.77699999999997 | 0.777 | 0.001 | 0.999 |
| 0.77749999999997 | 0.777 | 0.001 | 0.999 |
| 0.77799999999997 | 0.778 | 0.001 | 0.999 |
| 0.77849999999997 | 0.778 | 0.001 | 0.999 |
| 0.77899999999997 | 0.779 | 0.001 | 0.999 |
| 0.779499999999969 | 0.779 | 0.001 | 0.999 |
| 0.779999999999969 | 0.78 | 0.001 | 0.999 |
| 0.780499999999969 | 0.78 | 0.001 | 0.999 |
| 0.780999999999969 | 0.781 | 0.001 | 0.999 |
| 0.781499999999969 | 0.781 | 0.001 | 0.999 |
| 0.781999999999969 | 0.782 | 0.001 | 0.999 |
| 0.782499999999969 | 0.782 | 0.001 | 0.999 |
| 0.782999999999969 | 0.783 | 0.001 | 0.999 |
| 0.783499999999969 | 0.783 | 0.001 | 0.999 |
| 0.783999999999969 | 0.784 | 0.001 | 0.999 |
| 0.784499999999969 | 0.784 | 0.001 | 0.999 |
| 0.784999999999969 | 0.785 | 0.001 | 0.999 |
| 0.785499999999969 | 0.785 | 0.001 | 0.999 |
| 0.785999999999969 | 0.786 | 0.001 | 0.999 |
| 0.786499999999969 | 0.786 | 0.001 | 0.999 |
| 0.786999999999969 | 0.787 | 0.001 | 0.999 |
| 0.787499999999969 | 0.787 | 0.001 | 0.999 |
| 0.787999999999969 | 0.788 | 0.001 | 0.999 |
| 0.788499999999968 | 0.788 | 0.001 | 0.999 |
| 0.788999999999968 | 0.789 | 0.001 | 0.999 |
| 0.789499999999968 | 0.789 | 0.001 | 0.999 |
| 0.789999999999968 | 0.79 | 0.001 | 0.999 |
| 0.790499999999968 | 0.79 | 0.001 | 0.999 |
| 0.790999999999968 | 0.791 | 0.001 | 0.999 |
| 0.791499999999968 | 0.791 | 0.001 | 0.999 |
| 0.791999999999968 | 0.792 | 0.001 | 0.999 |
| 0.792499999999968 | 0.792 | 0.001 | 0.999 |
| 0.792999999999968 | 0.793 | 0.001 | 0.999 |
| 0.793499999999968 | 0.793 | 0.001 | 0.999 |
| 0.793999999999968 | 0.794 | 0.001 | 0.999 |
| 0.794499999999968 | 0.794 | 0.001 | 0.999 |
| 0.794999999999968 | 0.795 | 0.001 | 0.999 |
| 0.795499999999968 | 0.795 | 0.001 | 0.999 |
| 0.795999999999968 | 0.796 | 0.001 | 0.999 |
| 0.796499999999968 | 0.796 | 0.001 | 0.999 |
| 0.796999999999968 | 0.797 | 0.001 | 0.999 |
| 0.797499999999967 | 0.797 | 0.001 | 0.999 |
| 0.797999999999967 | 0.798 | 0.001 | 0.999 |
| 0.798499999999967 | 0.798 | 0.001 | 0.999 |
| 0.798999999999967 | 0.799 | 0.001 | 0.999 |
| 0.799499999999967 | 0.799 | 0.001 | 0.999 |
| 0.799999999999967 | 0.8 | 0.001 | 0.999 |
| 0.800499999999967 | 0.8 | 0.001 | 0.999 |
| 0.800999999999967 | 0.801 | 0.001 | 0.999 |
| 0.801499999999967 | 0.801 | 0.001 | 0.999 |
| 0.801999999999967 | 0.802 | 0.001 | 0.999 |
| 0.802499999999967 | 0.802 | 0.001 | 0.999 |
| 0.802999999999967 | 0.803 | 0.001 | 0.999 |
| 0.803499999999967 | 0.803 | 0.001 | 0.999 |
| 0.803999999999967 | 0.804 | 0.001 | 0.999 |
| 0.804499999999967 | 0.804 | 0.001 | 0.999 |
| 0.804999999999967 | 0.805 | 0.001 | 0.999 |
| 0.805499999999967 | 0.805 | 0.001 | 0.999 |
| 0.805999999999967 | 0.806 | 0.001 | 0.999 |
| 0.806499999999967 | 0.806 | 0.001 | 0.999 |
| 0.806999999999966 | 0.807 | 0.001 | 0.999 |
| 0.807499999999966 | 0.807 | 0.001 | 0.999 |
| 0.807999999999966 | 0.808 | 0.001 | 0.999 |
| 0.808499999999966 | 0.808 | 0.001 | 0.999 |
| 0.808999999999966 | 0.809 | 0.001 | 0.999 |
| 0.809499999999966 | 0.809 | 0.001 | 0.999 |
| 0.809999999999966 | 0.81 | 0.001 | 0.999 |
| 0.810499999999966 | 0.81 | 0.001 | 0.999 |
| 0.810999999999966 | 0.811 | 0.001 | 0.999 |
| 0.811499999999966 | 0.811 | 0.001 | 0.999 |
| 0.811999999999966 | 0.812 | 0.001 | 0.999 |
| 0.812499999999966 | 0.812 | 0.001 | 0.999 |
| 0.812999999999966 | 0.813 | 0.001 | 0.999 |
| 0.813499999999966 | 0.813 | 0.001 | 0.999 |
| 0.813999999999966 | 0.814 | 0.001 | 0.999 |
| 0.814499999999966 | 0.814 | 0.001 | 0.999 |
| 0.814999999999966 | 0.815 | 0.001 | 0.999 |
| 0.815499999999966 | 0.815 | 0.001 | 0.999 |
| 0.815999999999965 | 0.816 | 0.001 | 0.999 |
| 0.816499999999965 | 0.816 | 0.001 | 0.999 |
| 0.816999999999965 | 0.817 | 0.001 | 0.999 |
| 0.817499999999965 | 0.817 | 0.001 | 0.999 |
| 0.817999999999965 | 0.818 | 0.001 | 0.999 |
| 0.818499999999965 | 0.818 | 0.001 | 0.999 |
| 0.818999999999965 | 0.819 | 0.001 | 0.999 |
| 0.819499999999965 | 0.819 | 0.001 | 0.999 |
| 0.819999999999965 | 0.82 | 0.001 | 0.999 |
| 0.820499999999965 | 0.82 | 0.001 | 0.999 |
| 0.820999999999965 | 0.821 | 0.001 | 0.999 |
| 0.821499999999965 | 0.821 | 0.001 | 0.999 |
| 0.821999999999965 | 0.822 | 0.001 | 0.999 |
| 0.822499999999965 | 0.822 | 0.001 | 0.999 |
| 0.822999999999965 | 0.823 | 0.001 | 0.999 |
| 0.823499999999965 | 0.823 | 0.001 | 0.999 |
| 0.823999999999965 | 0.824 | 0.001 | 0.999 |
| 0.824499999999965 | 0.824 | 0.001 | 0.999 |
| 0.824999999999964 | 0.825 | 0.001 | 0.999 |
| 0.825499999999964 | 0.825 | 0.001 | 0.999 |
| 0.825999999999964 | 0.826 | 0.001 | 0.999 |
| 0.826499999999964 | 0.826 | 0.001 | 0.999 |
| 0.826999999999964 | 0.827 | 0.001 | 0.999 |
| 0.827499999999964 | 0.827 | 0.001 | 0.999 |
| 0.827999999999964 | 0.828 | 0.001 | 0.999 |
| 0.828499999999964 | 0.828 | 0.001 | 0.999 |
| 0.828999999999964 | 0.829 | 0.001 | 0.999 |
| 0.829499999999964 | 0.829 | 0.001 | 0.999 |
| 0.829999999999964 | 0.83 | 0.001 | 0.999 |
| 0.830499999999964 | 0.83 | 0.001 | 0.999 |
| 0.830999999999964 | 0.831 | 0.001 | 0.999 |
| 0.831499999999964 | 0.831 | 0.001 | 0.999 |
| 0.831999999999964 | 0.832 | 0.001 | 0.999 |
| 0.832499999999964 | 0.832 | 0.001 | 0.999 |
| 0.832999999999964 | 0.833 | 0.001 | 0.999 |
| 0.833499999999964 | 0.833 | 0.001 | 0.999 |
| 0.833999999999963 | 0.834 | 0.001 | 0.999 |
| 0.834499999999963 | 0.834 | 0.001 | 0.999 |
| 0.834999999999963 | 0.835 | 0.001 | 0.999 |
| 0.835499999999963 | 0.835 | 0.001 | 0.999 |
| 0.835999999999963 | 0.836 | 0.001 | 0.999 |
| 0.836499999999963 | 0.836 | 0.001 | 0.999 |
| 0.836999999999963 | 0.837 | 0.001 | 0.999 |
| 0.837499999999963 | 0.837 | 0.001 | 0.999 |
| 0.837999999999963 | 0.838 | 0.001 | 0.999 |
| 0.838499999999963 | 0.838 | 0.001 | 0.999 |
| 0.838999999999963 | 0.839 | 0.001 | 0.999 |
| 0.839499999999963 | 0.839 | 0.001 | 0.999 |
| 0.839999999999963 | 0.84 | 0.001 | 0.999 |
| 0.840499999999963 | 0.84 | 0.001 | 0.999 |
| 0.840999999999963 | 0.841 | 0.001 | 0.999 |
| 0.841499999999963 | 0.841 | 0.001 | 0.999 |
| 0.841999999999963 | 0.842 | 0.001 | 0.999 |
| 0.842499999999963 | 0.842 | 0.001 | 0.999 |
| 0.842999999999963 | 0.843 | 0.001 | 0.999 |
| 0.843499999999962 | 0.843 | 0.001 | 0.999 |
| 0.843999999999962 | 0.844 | 0.001 | 0.999 |
| 0.844499999999962 | 0.844 | 0.001 | 0.999 |
| 0.844999999999962 | 0.845 | 0.001 | 0.999 |
| 0.845499999999962 | 0.845 | 0.001 | 0.999 |
| 0.845999999999962 | 0.846 | 0.001 | 0.999 |
| 0.846499999999962 | 0.846 | 0.001 | 0.999 |
| 0.846999999999962 | 0.847 | 0.001 | 0.999 |
| 0.847499999999962 | 0.847 | 0.001 | 0.999 |
| 0.847999999999962 | 0.848 | 0.001 | 0.999 |
| 0.848499999999962 | 0.848 | 0.001 | 0.999 |
| 0.848999999999962 | 0.849 | 0.001 | 0.999 |
| 0.849499999999962 | 0.849 | 0.001 | 0.999 |
| 0.849999999999962 | 0.85 | 0.001 | 0.999 |
| 0.850499999999962 | 0.85 | 0.001 | 0.999 |
| 0.850999999999962 | 0.851 | 0.001 | 0.999 |
| 0.851499999999962 | 0.851 | 0.001 | 0.999 |
| 0.851999999999962 | 0.852 | 0.001 | 0.999 |
| 0.852499999999961 | 0.852 | 0.001 | 0.999 |
| 0.852999999999961 | 0.853 | 0.001 | 0.999 |
| 0.853499999999961 | 0.853 | 0.001 | 0.999 |
| 0.853999999999961 | 0.854 | 0.001 | 0.999 |
| 0.854499999999961 | 0.854 | 0.001 | 0.999 |
| 0.854999999999961 | 0.855 | 0.001 | 0.999 |
| 0.855499999999961 | 0.855 | 0.001 | 0.999 |
| 0.855999999999961 | 0.856 | 0.001 | 0.999 |
| 0.856499999999961 | 0.856 | 0.001 | 0.999 |
| 0.856999999999961 | 0.857 | 0.001 | 0.999 |
| 0.857499999999961 | 0.857 | 0.001 | 0.999 |
| 0.857999999999961 | 0.858 | 0.001 | 0.999 |
| 0.858499999999961 | 0.858 | 0.001 | 0.999 |
| 0.858999999999961 | 0.859 | 0.001 | 0.999 |
| 0.859499999999961 | 0.859 | 0.001 | 0.999 |
| 0.859999999999961 | 0.86 | 0.001 | 0.999 |
| 0.860499999999961 | 0.86 | 0.001 | 0.999 |
| 0.860999999999961 | 0.861 | 0.001 | 0.999 |
| 0.86149999999996 | 0.861 | 0.001 | 0.999 |
| 0.86199999999996 | 0.862 | 0.001 | 0.999 |
| 0.86249999999996 | 0.862 | 0.001 | 0.999 |
| 0.86299999999996 | 0.863 | 0.001 | 0.999 |
| 0.86349999999996 | 0.863 | 0.001 | 0.999 |
| 0.86399999999996 | 0.864 | 0.001 | 0.999 |
| 0.86449999999996 | 0.864 | 0.001 | 0.999 |
| 0.86499999999996 | 0.865 | 0.001 | 0.999 |
| 0.86549999999996 | 0.865 | 0.001 | 0.999 |
| 0.86599999999996 | 0.866 | 0.001 | 0.999 |
| 0.86649999999996 | 0.866 | 0.001 | 0.999 |
| 0.86699999999996 | 0.867 | 0.001 | 0.999 |
| 0.86749999999996 | 0.867 | 0.001 | 0.999 |
| 0.86799999999996 | 0.868 | 0.001 | 0.999 |
| 0.86849999999996 | 0.868 | 0.001 | 0.999 |
| 0.86899999999996 | 0.869 | 0.001 | 0.999 |
| 0.86949999999996 | 0.869 | 0.001 | 0.999 |
| 0.86999999999996 | 0.87 | 0.001 | 0.999 |
| 0.870499999999959 | 0.87 | 0.001 | 0.999 |
| 0.870999999999959 | 0.871 | 0.001 | 0.999 |
| 0.871499999999959 | 0.871 | 0.001 | 0.999 |
| 0.871999999999959 | 0.872 | 0.001 | 0.999 |
| 0.872499999999959 | 0.872 | 0.001 | 0.999 |
| 0.872999999999959 | 0.873 | 0.001 | 0.999 |
| 0.873499999999959 | 0.873 | 0.001 | 0.999 |
| 0.873999999999959 | 0.874 | 0.001 | 0.999 |
| 0.874499999999959 | 0.874 | 0.001 | 0.999 |
| 0.874999999999959 | 0.875 | 0.001 | 0.999 |
| 0.875499999999959 | 0.875 | 0.001 | 0.999 |
| 0.875999999999959 | 0.876 | 0.001 | 0.999 |
| 0.876499999999959 | 0.876 | 0.001 | 0.999 |
| 0.876999999999959 | 0.877 | 0.001 | 0.999 |
| 0.877499999999959 | 0.877 | 0.001 | 0.999 |
| 0.877999999999959 | 0.878 | 0.001 | 0.999 |
| 0.878499999999959 | 0.878 | 0.001 | 0.999 |
| 0.878999999999959 | 0.879 | 0.001 | 0.999 |
| 0.879499999999958 | 0.879 | 0.001 | 0.999 |
| 0.879999999999958 | 0.88 | 0.001 | 0.999 |
| 0.880499999999958 | 0.88 | 0.001 | 0.999 |
| 0.880999999999958 | 0.881 | 0.001 | 0.999 |
| 0.881499999999958 | 0.881 | 0.001 | 0.999 |
| 0.881999999999958 | 0.882 | 0.001 | 0.999 |
| 0.882499999999958 | 0.882 | 0.001 | 0.999 |
| 0.882999999999958 | 0.883 | 0.001 | 0.999 |
| 0.883499999999958 | 0.883 | 0.001 | 0.999 |
| 0.883999999999958 | 0.884 | 0.001 | 0.999 |
| 0.884499999999958 | 0.884 | 0.001 | 0.999 |
| 0.884999999999958 | 0.885 | 0.001 | 0.999 |
| 0.885499999999958 | 0.885 | 0.001 | 0.999 |
| 0.885999999999958 | 0.886 | 0.001 | 0.999 |
| 0.886499999999958 | 0.886 | 0.001 | 0.999 |
| 0.886999999999958 | 0.887 | 0.001 | 0.999 |
| 0.887499999999958 | 0.887 | 0.001 | 0.999 |
| 0.887999999999958 | 0.888 | 0.001 | 0.999 |
| 0.888499999999957 | 0.888 | 0.001 | 0.999 |
| 0.888999999999957 | 0.889 | 0.001 | 0.999 |
| 0.889499999999957 | 0.889 | 0.001 | 0.999 |
| 0.889999999999957 | 0.89 | 0.001 | 0.999 |
| 0.890499999999957 | 0.89 | 0.001 | 0.999 |
| 0.890999999999957 | 0.891 | 0.001 | 0.999 |
| 0.891499999999957 | 0.891 | 0.001 | 0.999 |
| 0.891999999999957 | 0.892 | 0.001 | 0.999 |
| 0.892499999999957 | 0.892 | 0.001 | 0.999 |
| 0.892999999999957 | 0.893 | 0.001 | 0.999 |
| 0.893499999999957 | 0.893 | 0.001 | 0.999 |
| 0.893999999999957 | 0.894 | 0.001 | 0.999 |
| 0.894499999999957 | 0.894 | 0.001 | 0.999 |
| 0.894999999999957 | 0.895 | 0.001 | 0.999 |
| 0.895499999999957 | 0.895 | 0.001 | 0.999 |
| 0.895999999999957 | 0.896 | 0.001 | 0.999 |
| 0.896499999999957 | 0.896 | 0.001 | 0.999 |
| 0.896999999999957 | 0.897 | 0.001 | 0.999 |
| 0.897499999999956 | 0.897 | 0.001 | 0.999 |
| 0.897999999999956 | 0.898 | 0.001 | 0.999 |
| 0.898499999999956 | 0.898 | 0.001 | 0.999 |
| 0.898999999999956 | 0.899 | 0.001 | 0.999 |
| 0.899499999999956 | 0.899 | 0.001 | 0.999 |
| 0.899999999999956 | 0.9 | 0.001 | 0.999 |
| 0.900499999999956 | 0.9 | 0.001 | 0.999 |
| 0.900999999999956 | 0.901 | 0.001 | 0.999 |
| 0.901499999999956 | 0.901 | 0.001 | 0.999 |
| 0.901999999999956 | 0.902 | 0.001 | 0.999 |
| 0.902499999999956 | 0.902 | 0.001 | 0.999 |
| 0.902999999999956 | 0.903 | 0.001 | 0.999 |
| 0.903499999999956 | 0.903 | 0.001 | 0.999 |
| 0.903999999999956 | 0.904 | 0.001 | 0.999 |
| 0.904499999999956 | 0.904 | 0.001 | 0.999 |
| 0.904999999999956 | 0.905 | 0.001 | 0.999 |
| 0.905499999999956 | 0.905 | 0.001 | 0.999 |
| 0.905999999999956 | 0.906 | 0.001 | 0.999 |
| 0.906499999999956 | 0.906 | 0.001 | 0.999 |
| 0.906999999999955 | 0.907 | 0.001 | 0.999 |
| 0.907499999999955 | 0.907 | 0.001 | 0.999 |
| 0.907999999999955 | 0.908 | 0.001 | 0.999 |
| 0.908499999999955 | 0.908 | 0.001 | 0.999 |
| 0.908999999999955 | 0.909 | 0.001 | 0.999 |
| 0.909499999999955 | 0.909 | 0.001 | 0.999 |
| 0.909999999999955 | 0.91 | 0.001 | 0.999 |
| 0.910499999999955 | 0.91 | 0.001 | 0.999 |
| 0.910999999999955 | 0.911 | 0.001 | 0.999 |
| 0.911499999999955 | 0.911 | 0.001 | 0.999 |
| 0.911999999999955 | 0.912 | 0.001 | 0.999 |
| 0.912499999999955 | 0.912 | 0.001 | 0.999 |
| 0.912999999999955 | 0.913 | 0.001 | 0.999 |
| 0.913499999999955 | 0.913 | 0.001 | 0.999 |
| 0.913999999999955 | 0.914 | 0.001 | 0.999 |
| 0.914499999999955 | 0.914 | 0.001 | 0.999 |
| 0.914999999999955 | 0.915 | 0.001 | 0.999 |
| 0.915499999999955 | 0.915 | 0.001 | 0.999 |
| 0.915999999999954 | 0.916 | 0.001 | 0.999 |
| 0.916499999999954 | 0.916 | 0.001 | 0.999 |
| 0.916999999999954 | 0.917 | 0.001 | 0.999 |
| 0.917499999999954 | 0.917 | 0.001 | 0.999 |
| 0.917999999999954 | 0.918 | 0.001 | 0.999 |
| 0.918499999999954 | 0.918 | 0.001 | 0.999 |
| 0.918999999999954 | 0.919 | 0.001 | 0.999 |
| 0.919499999999954 | 0.919 | 0.001 | 0.999 |
| 0.919999999999954 | 0.92 | 0.001 | 0.999 |
| 0.920499999999954 | 0.92 | 0.001 | 0.999 |
| 0.920999999999954 | 0.921 | 0.001 | 0.999 |
| 0.921499999999954 | 0.921 | 0.001 | 0.999 |
| 0.921999999999954 | 0.922 | 0.001 | 0.999 |
| 0.922499999999954 | 0.922 | 0.001 | 0.999 |
| 0.922999999999954 | 0.923 | 0.001 | 0.999 |
| 0.923499999999954 | 0.923 | 0.001 | 0.999 |
| 0.923999999999954 | 0.924 | 0.001 | 0.999 |
| 0.924499999999954 | 0.924 | 0.001 | 0.999 |
| 0.924999999999953 | 0.925 | 0.001 | 0.999 |
| 0.925499999999953 | 0.925 | 0.001 | 0.999 |
| 0.925999999999953 | 0.926 | 0.001 | 0.999 |
| 0.926499999999953 | 0.926 | 0.001 | 0.999 |
| 0.926999999999953 | 0.927 | 0.001 | 0.999 |
| 0.927499999999953 | 0.927 | 0.001 | 0.999 |
| 0.927999999999953 | 0.928 | 0.001 | 0.999 |
| 0.928499999999953 | 0.928 | 0.001 | 0.999 |
| 0.928999999999953 | 0.929 | 0.001 | 0.999 |
| 0.929499999999953 | 0.929 | 0.001 | 0.999 |
| 0.929999999999953 | 0.93 | 0.001 | 0.999 |
| 0.930499999999953 | 0.93 | 0.001 | 0.999 |
| 0.930999999999953 | 0.931 | 0.001 | 0.999 |
| 0.931499999999953 | 0.931 | 0.001 | 0.999 |
| 0.931999999999953 | 0.932 | 0.001 | 0.999 |
| 0.932499999999953 | 0.932 | 0.001 | 0.999 |
| 0.932999999999953 | 0.933 | 0.001 | 0.999 |
| 0.933499999999953 | 0.933 | 0.001 | 0.999 |
| 0.933999999999953 | 0.934 | 0.001 | 0.999 |
| 0.934499999999952 | 0.934 | 0.001 | 0.999 |
| 0.934999999999952 | 0.935 | 0.001 | 0.999 |
| 0.935499999999952 | 0.935 | 0.001 | 0.999 |
| 0.935999999999952 | 0.936 | 0.001 | 0.999 |
| 0.936499999999952 | 0.936 | 0.001 | 0.999 |
| 0.936999999999952 | 0.937 | 0.001 | 0.999 |
| 0.937499999999952 | 0.937 | 0.001 | 0.999 |
| 0.937999999999952 | 0.938 | 0.001 | 0.999 |
| 0.938499999999952 | 0.938 | 0.001 | 0.999 |
| 0.938999999999952 | 0.939 | 0.001 | 0.999 |
| 0.939499999999952 | 0.939 | 0.001 | 0.999 |
| 0.939999999999952 | 0.94 | 0.001 | 0.999 |
| 0.940499999999952 | 0.94 | 0.001 | 0.999 |
| 0.940999999999952 | 0.941 | 0.001 | 0.999 |
| 0.941499999999952 | 0.941 | 0.001 | 0.999 |
| 0.941999999999952 | 0.942 | 0.001 | 0.999 |
| 0.942499999999952 | 0.942 | 0.001 | 0.999 |
| 0.942999999999952 | 0.943 | 0.001 | 0.999 |
| 0.943499999999951 | 0.943 | 0.001 | 0.999 |
| 0.943999999999951 | 0.944 | 0.001 | 0.999 |
| 0.944499999999951 | 0.944 | 0.001 | 0.999 |
| 0.944999999999951 | 0.945 | 0.001 | 0.999 |
| 0.945499999999951 | 0.945 | 0.001 | 0.999 |
| 0.945999999999951 | 0.946 | 0.001 | 0.999 |
| 0.946499999999951 | 0.946 | 0.001 | 0.999 |
| 0.946999999999951 | 0.947 | 0.001 | 0.999 |
| 0.947499999999951 | 0.947 | 0.001 | 0.999 |
| 0.947999999999951 | 0.948 | 0.001 | 0.999 |
| 0.948499999999951 | 0.948 | 0.001 | 0.999 |
| 0.948999999999951 | 0.949 | 0.001 | 0.999 |
| 0.949499999999951 | 0.949 | 0.001 | 0.999 |
| 0.949999999999951 | 0.95 | 0.001 | 0.999 |
| 0.950499999999951 | 0.95 | 0.001 | 0.999 |
| 0.950999999999951 | 0.951 | 0.001 | 0.999 |
| 0.951499999999951 | 0.951 | 0.001 | 0.999 |
| 0.951999999999951 | 0.952 | 0.001 | 0.999 |
| 0.95249999999995 | 0.952 | 0.001 | 0.999 |
| 0.95299999999995 | 0.953 | 0.001 | 0.999 |
| 0.95349999999995 | 0.953 | 0.001 | 0.999 |
| 0.95399999999995 | 0.954 | 0.001 | 0.999 |
| 0.95449999999995 | 0.954 | 0.001 | 0.999 |
| 0.95499999999995 | 0.955 | 0.001 | 0.999 |
| 0.95549999999995 | 0.955 | 0.001 | 0.999 |
| 0.95599999999995 | 0.956 | 0.001 | 0.999 |
| 0.95649999999995 | 0.956 | 0.001 | 0.999 |
| 0.95699999999995 | 0.957 | 0.001 | 0.999 |
| 0.95749999999995 | 0.957 | 0.001 | 0.999 |
| 0.95799999999995 | 0.958 | 0.001 | 0.999 |
| 0.95849999999995 | 0.958 | 0.001 | 0.999 |
| 0.95899999999995 | 0.959 | 0.001 | 0.999 |
| 0.95949999999995 | 0.959 | 0.001 | 0.999 |
| 0.95999999999995 | 0.96 | 0.001 | 0.999 |
| 0.96049999999995 | 0.96 | 0.001 | 0.999 |
| 0.96099999999995 | 0.961 | 0.001 | 0.999 |
| 0.961499999999949 | 0.961 | 0.001 | 0.999 |
| 0.961999999999949 | 0.962 | 0.001 | 0.999 |
| 0.962499999999949 | 0.962 | 0.001 | 0.999 |
| 0.962999999999949 | 0.963 | 0.001 | 0.999 |
| 0.963499999999949 | 0.963 | 0.001 | 0.999 |
| 0.963999999999949 | 0.964 | 0.001 | 0.999 |
| 0.964499999999949 | 0.964 | 0.001 | 0.999 |
| 0.964999999999949 | 0.965 | 0.001 | 0.999 |
| 0.965499999999949 | 0.965 | 0.001 | 0.999 |
| 0.965999999999949 | 0.966 | 0.001 | 0.999 |
| 0.966499999999949 | 0.966 | 0.001 | 0.999 |
| 0.966999999999949 | 0.967 | 0.001 | 0.999 |
| 0.967499999999949 | 0.967 | 0.001 | 0.999 |
| 0.967999999999949 | 0.968 | 0.001 | 0.999 |
| 0.968499999999949 | 0.968 | 0.001 | 0.999 |
| 0.968999999999949 | 0.969 | 0.001 | 0.999 |
| 0.969499999999949 | 0.969 | 0.001 | 0.999 |
| 0.969999999999949 | 0.97 | 0.001 | 0.999 |
| 0.970499999999948 | 0.97 | 0.001 | 0.999 |
| 0.970999999999948 | 0.971 | 0.001 | 0.999 |
| 0.971499999999948 | 0.971 | 0.001 | 0.999 |
| 0.971999999999948 | 0.972 | 0.001 | 0.999 |
| 0.972499999999948 | 0.972 | 0.001 | 0.999 |
| 0.972999999999948 | 0.973 | 0.001 | 0.999 |
| 0.973499999999948 | 0.973 | 0.001 | 0.999 |
| 0.973999999999948 | 0.974 | 0.001 | 0.999 |
| 0.974499999999948 | 0.974 | 0.001 | 0.999 |
| 0.974999999999948 | 0.975 | 0.001 | 0.999 |
| 0.975499999999948 | 0.975 | 0.001 | 0.999 |
| 0.975999999999948 | 0.976 | 0.001 | 0.999 |
| 0.976499999999948 | 0.976 | 0.001 | 0.999 |
| 0.976999999999948 | 0.977 | 0.001 | 0.999 |
| 0.977499999999948 | 0.977 | 0.001 | 0.999 |
| 0.977999999999948 | 0.978 | 0.001 | 0.999 |
| 0.978499999999948 | 0.978 | 0.001 | 0.999 |
| 0.978999999999948 | 0.979 | 0.001 | 0.999 |
| 0.979499999999947 | 0.979 | 0.001 | 0.999 |
| 0.979999999999947 | 0.98 | 0.001 | 0.999 |
| 0.980499999999947 | 0.98 | 0.001 | 0.999 |
| 0.980999999999947 | 0.981 | 0.001 | 0.999 |
| 0.981499999999947 | 0.981 | 0.001 | 0.999 |
| 0.981999999999947 | 0.982 | 0.001 | 0.999 |
| 0.982499999999947 | 0.982 | 0.001 | 0.999 |
| 0.982999999999947 | 0.983 | 0.001 | 0.999 |
| 0.983499999999947 | 0.983 | 0.001 | 0.999 |
| 0.983999999999947 | 0.984 | 0.001 | 0.999 |
| 0.984499999999947 | 0.984 | 0.001 | 0.999 |
| 0.984999999999947 | 0.985 | 0.001 | 0.999 |
| 0.985499999999947 | 0.985 | 0.001 | 0.999 |
| 0.985999999999947 | 0.986 | 0.001 | 0.999 |
| 0.986499999999947 | 0.986 | 0.001 | 0.999 |
| 0.986999999999947 | 0.987 | 0.001 | 0.999 |
| 0.987499999999947 | 0.987 | 0.001 | 0.999 |
| 0.987999999999947 | 0.988 | 0.001 | 0.999 |
| 0.988499999999946 | 0.988 | 0.001 | 0.999 |
| 0.988999999999946 | 0.989 | 0.001 | 0.999 |
| 0.989499999999946 | 0.989 | 0.001 | 0.999 |
| 0.989999999999946 | 0.99 | 0.001 | 0.999 |
| 0.990499999999946 | 0.99 | 0.001 | 0.999 |
| 0.990999999999946 | 0.991 | 0.001 | 0.999 |
| 0.991499999999946 | 0.991 | 0.001 | 0.999 |
| 0.991999999999946 | 0.992 | 0.001 | 0.999 |
| 0.992499999999946 | 0.992 | 0.001 | 0.999 |
| 0.992999999999946 | 0.993 | 0.001 | 0.999 |
| 0.993499999999946 | 0.993 | 0.001 | 0.999 |
| 0.993999999999946 | 0.994 | 0.001 | 0.999 |
| 0.994499999999946 | 0.994 | 0.001 | 0.999 |
| 0.994999999999946 | 0.995 | 0.001 | 0.999 |
| 0.995499999999946 | 0.995 | 0.001 | 0.999 |
| 0.995999999999946 | 0.996 | 0.001 | 0.999 |
| 0.996499999999946 | 0.996 | 0.001 | 0.999 |
| 0.996999999999946 | 0.997 | 0.001 | 0.999 |
| 0.997499999999945 | 0.997 | 0.001 | 0.999 |
| 0.997999999999945 | 0.998 | 0.001 | 0.999 |
| 0.998499999999945 | 0.998 | 0.333 | 0.999 |
| 0.998999999999945 | 0.999 | 0.666 | 0.999 |
| 0.999499999999945 | 0.999 | 0.999 | 0.999 |
| 0.999999999999945 | 1 | 0.999 | 0.999 |